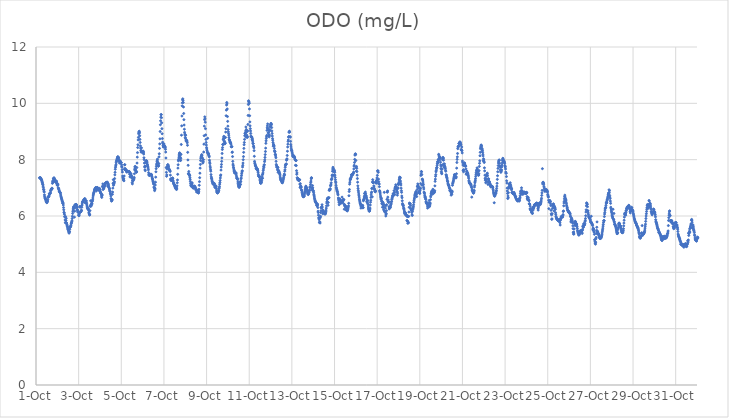
| Category | ODO (mg/L) |
|---|---|
| 44835.166666666664 | 7.36 |
| 44835.177083333336 | 7.35 |
| 44835.1875 | 7.35 |
| 44835.197916666664 | 7.35 |
| 44835.208333333336 | 7.36 |
| 44835.21875 | 7.35 |
| 44835.229166666664 | 7.32 |
| 44835.239583333336 | 7.31 |
| 44835.25 | 7.3 |
| 44835.260416666664 | 7.29 |
| 44835.270833333336 | 7.26 |
| 44835.28125 | 7.22 |
| 44835.291666666664 | 7.2 |
| 44835.302083333336 | 7.17 |
| 44835.3125 | 7.13 |
| 44835.322916666664 | 7.11 |
| 44835.333333333336 | 7.06 |
| 44835.34375 | 7.01 |
| 44835.354166666664 | 6.94 |
| 44835.364583333336 | 6.94 |
| 44835.375 | 6.88 |
| 44835.385416666664 | 6.85 |
| 44835.395833333336 | 6.75 |
| 44835.40625 | 6.69 |
| 44835.416666666664 | 6.64 |
| 44835.427083333336 | 6.64 |
| 44835.4375 | 6.61 |
| 44835.447916666664 | 6.61 |
| 44835.458333333336 | 6.57 |
| 44835.46875 | 6.54 |
| 44835.479166666664 | 6.52 |
| 44835.489583333336 | 6.49 |
| 44835.5 | 6.51 |
| 44835.510416666664 | 6.47 |
| 44835.520833333336 | 6.49 |
| 44835.53125 | 6.52 |
| 44835.541666666664 | 6.53 |
| 44835.552083333336 | 6.58 |
| 44835.5625 | 6.67 |
| 44835.572916666664 | 6.67 |
| 44835.583333333336 | 6.67 |
| 44835.59375 | 6.69 |
| 44835.604166666664 | 6.7 |
| 44835.614583333336 | 6.73 |
| 44835.625 | 6.79 |
| 44835.635416666664 | 6.79 |
| 44835.645833333336 | 6.8 |
| 44835.65625 | 6.8 |
| 44835.666666666664 | 6.8 |
| 44835.677083333336 | 6.84 |
| 44835.6875 | 6.9 |
| 44835.697916666664 | 6.91 |
| 44835.708333333336 | 6.95 |
| 44835.71875 | 6.95 |
| 44835.729166666664 | 6.95 |
| 44835.739583333336 | 6.96 |
| 44835.75 | 6.99 |
| 44835.760416666664 | 6.97 |
| 44835.770833333336 | 7.16 |
| 44835.78125 | 7.24 |
| 44835.791666666664 | 7.2 |
| 44835.802083333336 | 7.22 |
| 44835.8125 | 7.32 |
| 44835.822916666664 | 7.33 |
| 44835.833333333336 | 7.33 |
| 44835.84375 | 7.36 |
| 44835.854166666664 | 7.33 |
| 44835.864583333336 | 7.3 |
| 44835.875 | 7.3 |
| 44835.885416666664 | 7.27 |
| 44835.895833333336 | 7.25 |
| 44835.90625 | 7.25 |
| 44835.916666666664 | 7.2 |
| 44835.927083333336 | 7.21 |
| 44835.9375 | 7.24 |
| 44835.947916666664 | 7.2 |
| 44835.958333333336 | 7.24 |
| 44835.96875 | 7.2 |
| 44835.979166666664 | 7.14 |
| 44835.989583333336 | 7.1 |
| 44836.0 | 7.1 |
| 44836.010416666664 | 7.11 |
| 44836.020833333336 | 7.09 |
| 44836.03125 | 7.13 |
| 44836.041666666664 | 7 |
| 44836.052083333336 | 6.97 |
| 44836.0625 | 6.98 |
| 44836.072916666664 | 6.94 |
| 44836.083333333336 | 6.89 |
| 44836.09375 | 6.88 |
| 44836.104166666664 | 6.87 |
| 44836.114583333336 | 6.85 |
| 44836.125 | 6.84 |
| 44836.135416666664 | 6.83 |
| 44836.145833333336 | 6.81 |
| 44836.15625 | 6.75 |
| 44836.166666666664 | 6.71 |
| 44836.177083333336 | 6.68 |
| 44836.1875 | 6.65 |
| 44836.197916666664 | 6.62 |
| 44836.208333333336 | 6.59 |
| 44836.21875 | 6.56 |
| 44836.229166666664 | 6.53 |
| 44836.239583333336 | 6.51 |
| 44836.25 | 6.45 |
| 44836.260416666664 | 6.48 |
| 44836.270833333336 | 6.45 |
| 44836.28125 | 6.39 |
| 44836.291666666664 | 6.3 |
| 44836.302083333336 | 6.22 |
| 44836.3125 | 6.13 |
| 44836.322916666664 | 6.11 |
| 44836.333333333336 | 6.06 |
| 44836.34375 | 5.98 |
| 44836.354166666664 | 5.97 |
| 44836.364583333336 | 5.86 |
| 44836.375 | 5.76 |
| 44836.385416666664 | 5.98 |
| 44836.395833333336 | 5.78 |
| 44836.40625 | 5.84 |
| 44836.416666666664 | 5.92 |
| 44836.427083333336 | 5.75 |
| 44836.4375 | 5.75 |
| 44836.447916666664 | 5.7 |
| 44836.458333333336 | 5.67 |
| 44836.46875 | 5.63 |
| 44836.479166666664 | 5.61 |
| 44836.489583333336 | 5.56 |
| 44836.5 | 5.52 |
| 44836.510416666664 | 5.51 |
| 44836.520833333336 | 5.49 |
| 44836.53125 | 5.45 |
| 44836.541666666664 | 5.42 |
| 44836.552083333336 | 5.39 |
| 44836.5625 | 5.43 |
| 44836.572916666664 | 5.45 |
| 44836.583333333336 | 5.53 |
| 44836.59375 | 5.6 |
| 44836.604166666664 | 5.6 |
| 44836.614583333336 | 5.63 |
| 44836.625 | 5.63 |
| 44836.635416666664 | 5.67 |
| 44836.645833333336 | 5.72 |
| 44836.65625 | 5.75 |
| 44836.666666666664 | 5.76 |
| 44836.677083333336 | 5.8 |
| 44836.6875 | 5.83 |
| 44836.697916666664 | 5.91 |
| 44836.708333333336 | 5.99 |
| 44836.71875 | 6.09 |
| 44836.729166666664 | 6.16 |
| 44836.739583333336 | 6.21 |
| 44836.75 | 6.26 |
| 44836.760416666664 | 6.32 |
| 44836.770833333336 | 6.3 |
| 44836.78125 | 6.34 |
| 44836.791666666664 | 6.3 |
| 44836.802083333336 | 5.96 |
| 44836.8125 | 6.17 |
| 44836.822916666664 | 6.28 |
| 44836.833333333336 | 6.4 |
| 44836.84375 | 6.4 |
| 44836.854166666664 | 6.37 |
| 44836.864583333336 | 6.39 |
| 44836.875 | 6.41 |
| 44836.885416666664 | 6.41 |
| 44836.895833333336 | 6.4 |
| 44836.90625 | 6.36 |
| 44836.916666666664 | 6.31 |
| 44836.927083333336 | 6.3 |
| 44836.9375 | 6.22 |
| 44836.947916666664 | 6.21 |
| 44836.958333333336 | 6.14 |
| 44836.96875 | 6.15 |
| 44836.979166666664 | 6.16 |
| 44836.989583333336 | 6.13 |
| 44837.0 | 6.02 |
| 44837.010416666664 | 6.05 |
| 44837.020833333336 | 6.01 |
| 44837.03125 | 6.08 |
| 44837.041666666664 | 6.12 |
| 44837.052083333336 | 6.33 |
| 44837.0625 | 6.34 |
| 44837.072916666664 | 6.31 |
| 44837.083333333336 | 6.15 |
| 44837.09375 | 6.15 |
| 44837.104166666664 | 6.15 |
| 44837.114583333336 | 6.17 |
| 44837.125 | 6.2 |
| 44837.135416666664 | 6.2 |
| 44837.145833333336 | 6.31 |
| 44837.15625 | 6.38 |
| 44837.166666666664 | 6.43 |
| 44837.177083333336 | 6.49 |
| 44837.1875 | 6.5 |
| 44837.197916666664 | 6.51 |
| 44837.208333333336 | 6.53 |
| 44837.21875 | 6.54 |
| 44837.229166666664 | 6.55 |
| 44837.239583333336 | 6.57 |
| 44837.25 | 6.57 |
| 44837.260416666664 | 6.59 |
| 44837.270833333336 | 6.61 |
| 44837.28125 | 6.6 |
| 44837.291666666664 | 6.6 |
| 44837.302083333336 | 6.61 |
| 44837.3125 | 6.47 |
| 44837.322916666664 | 6.47 |
| 44837.333333333336 | 6.53 |
| 44837.34375 | 6.54 |
| 44837.354166666664 | 6.54 |
| 44837.364583333336 | 6.49 |
| 44837.375 | 6.44 |
| 44837.385416666664 | 6.39 |
| 44837.395833333336 | 6.35 |
| 44837.40625 | 6.31 |
| 44837.416666666664 | 6.26 |
| 44837.427083333336 | 6.27 |
| 44837.4375 | 6.26 |
| 44837.447916666664 | 6.25 |
| 44837.458333333336 | 6.24 |
| 44837.46875 | 6.2 |
| 44837.479166666664 | 6.13 |
| 44837.489583333336 | 6.08 |
| 44837.5 | 6.07 |
| 44837.510416666664 | 6.04 |
| 44837.520833333336 | 6.04 |
| 44837.53125 | 6.19 |
| 44837.541666666664 | 6.34 |
| 44837.552083333336 | 6.36 |
| 44837.5625 | 6.54 |
| 44837.572916666664 | 6.4 |
| 44837.583333333336 | 6.35 |
| 44837.59375 | 6.41 |
| 44837.604166666664 | 6.45 |
| 44837.614583333336 | 6.4 |
| 44837.625 | 6.45 |
| 44837.635416666664 | 6.52 |
| 44837.645833333336 | 6.54 |
| 44837.65625 | 6.58 |
| 44837.666666666664 | 6.64 |
| 44837.677083333336 | 6.71 |
| 44837.6875 | 6.75 |
| 44837.697916666664 | 6.79 |
| 44837.708333333336 | 6.82 |
| 44837.71875 | 6.84 |
| 44837.729166666664 | 6.88 |
| 44837.739583333336 | 6.92 |
| 44837.75 | 6.94 |
| 44837.760416666664 | 6.95 |
| 44837.770833333336 | 6.97 |
| 44837.78125 | 6.98 |
| 44837.791666666664 | 7 |
| 44837.802083333336 | 7.01 |
| 44837.8125 | 7 |
| 44837.822916666664 | 6.96 |
| 44837.833333333336 | 6.89 |
| 44837.84375 | 6.97 |
| 44837.854166666664 | 6.99 |
| 44837.864583333336 | 7.01 |
| 44837.875 | 7.01 |
| 44837.885416666664 | 7 |
| 44837.895833333336 | 7 |
| 44837.90625 | 6.96 |
| 44837.916666666664 | 6.96 |
| 44837.927083333336 | 6.92 |
| 44837.9375 | 6.94 |
| 44837.947916666664 | 6.94 |
| 44837.958333333336 | 6.92 |
| 44837.96875 | 6.96 |
| 44837.979166666664 | 6.98 |
| 44837.989583333336 | 6.9 |
| 44838.0 | 6.94 |
| 44838.010416666664 | 6.88 |
| 44838.020833333336 | 6.85 |
| 44838.03125 | 6.82 |
| 44838.041666666664 | 6.81 |
| 44838.052083333336 | 6.8 |
| 44838.0625 | 6.78 |
| 44838.072916666664 | 6.71 |
| 44838.083333333336 | 6.66 |
| 44838.09375 | 6.72 |
| 44838.104166666664 | 6.75 |
| 44838.114583333336 | 7.04 |
| 44838.125 | 7.06 |
| 44838.135416666664 | 7.14 |
| 44838.145833333336 | 6.94 |
| 44838.15625 | 6.99 |
| 44838.166666666664 | 6.98 |
| 44838.177083333336 | 6.97 |
| 44838.1875 | 7.01 |
| 44838.197916666664 | 7.04 |
| 44838.208333333336 | 7.05 |
| 44838.21875 | 7.09 |
| 44838.229166666664 | 7.09 |
| 44838.239583333336 | 7.13 |
| 44838.25 | 7.16 |
| 44838.260416666664 | 7.17 |
| 44838.270833333336 | 7.18 |
| 44838.28125 | 7.17 |
| 44838.291666666664 | 7.17 |
| 44838.302083333336 | 7.18 |
| 44838.3125 | 7.19 |
| 44838.322916666664 | 7.2 |
| 44838.333333333336 | 7.19 |
| 44838.34375 | 7.2 |
| 44838.354166666664 | 7.19 |
| 44838.364583333336 | 7.06 |
| 44838.375 | 7.07 |
| 44838.385416666664 | 7.15 |
| 44838.395833333336 | 7.11 |
| 44838.40625 | 7.06 |
| 44838.416666666664 | 7.02 |
| 44838.427083333336 | 7 |
| 44838.4375 | 6.96 |
| 44838.447916666664 | 6.97 |
| 44838.458333333336 | 6.9 |
| 44838.46875 | 6.88 |
| 44838.479166666664 | 6.86 |
| 44838.489583333336 | 6.8 |
| 44838.5 | 6.77 |
| 44838.510416666664 | 6.71 |
| 44838.520833333336 | 6.62 |
| 44838.53125 | 6.6 |
| 44838.541666666664 | 6.53 |
| 44838.552083333336 | 6.54 |
| 44838.5625 | 6.56 |
| 44838.572916666664 | 6.58 |
| 44838.583333333336 | 6.77 |
| 44838.59375 | 6.85 |
| 44838.604166666664 | 6.99 |
| 44838.614583333336 | 7.16 |
| 44838.625 | 7.29 |
| 44838.635416666664 | 7.09 |
| 44838.645833333336 | 7.13 |
| 44838.65625 | 7.16 |
| 44838.666666666664 | 7.18 |
| 44838.677083333336 | 7.22 |
| 44838.6875 | 7.33 |
| 44838.697916666664 | 7.46 |
| 44838.708333333336 | 7.55 |
| 44838.71875 | 7.66 |
| 44838.729166666664 | 7.73 |
| 44838.739583333336 | 7.78 |
| 44838.75 | 7.82 |
| 44838.760416666664 | 7.89 |
| 44838.770833333336 | 7.94 |
| 44838.78125 | 7.96 |
| 44838.791666666664 | 7.99 |
| 44838.802083333336 | 8.02 |
| 44838.8125 | 8.04 |
| 44838.822916666664 | 8.08 |
| 44838.833333333336 | 8.1 |
| 44838.84375 | 8.1 |
| 44838.854166666664 | 8.09 |
| 44838.864583333336 | 8.07 |
| 44838.875 | 8.05 |
| 44838.885416666664 | 7.99 |
| 44838.895833333336 | 7.98 |
| 44838.90625 | 7.96 |
| 44838.916666666664 | 7.88 |
| 44838.927083333336 | 7.92 |
| 44838.9375 | 7.96 |
| 44838.947916666664 | 7.94 |
| 44838.958333333336 | 7.93 |
| 44838.96875 | 7.9 |
| 44838.979166666664 | 7.91 |
| 44838.989583333336 | 7.9 |
| 44839.0 | 7.89 |
| 44839.010416666664 | 7.82 |
| 44839.020833333336 | 7.76 |
| 44839.03125 | 7.73 |
| 44839.041666666664 | 7.64 |
| 44839.052083333336 | 7.56 |
| 44839.0625 | 7.42 |
| 44839.072916666664 | 7.37 |
| 44839.083333333336 | 7.32 |
| 44839.09375 | 7.28 |
| 44839.104166666664 | 7.32 |
| 44839.114583333336 | 7.32 |
| 44839.125 | 7.25 |
| 44839.135416666664 | 7.42 |
| 44839.145833333336 | 7.66 |
| 44839.15625 | 7.82 |
| 44839.166666666664 | 7.82 |
| 44839.177083333336 | 7.69 |
| 44839.1875 | 7.64 |
| 44839.197916666664 | 7.64 |
| 44839.208333333336 | 7.62 |
| 44839.21875 | 7.64 |
| 44839.229166666664 | 7.64 |
| 44839.239583333336 | 7.61 |
| 44839.25 | 7.57 |
| 44839.260416666664 | 7.56 |
| 44839.270833333336 | 7.57 |
| 44839.28125 | 7.58 |
| 44839.291666666664 | 7.58 |
| 44839.302083333336 | 7.58 |
| 44839.3125 | 7.58 |
| 44839.322916666664 | 7.57 |
| 44839.333333333336 | 7.57 |
| 44839.34375 | 7.57 |
| 44839.354166666664 | 7.58 |
| 44839.364583333336 | 7.58 |
| 44839.375 | 7.58 |
| 44839.385416666664 | 7.56 |
| 44839.395833333336 | 7.48 |
| 44839.40625 | 7.39 |
| 44839.416666666664 | 7.48 |
| 44839.427083333336 | 7.52 |
| 44839.4375 | 7.5 |
| 44839.447916666664 | 7.49 |
| 44839.458333333336 | 7.49 |
| 44839.46875 | 7.43 |
| 44839.479166666664 | 7.38 |
| 44839.489583333336 | 7.41 |
| 44839.5 | 7.34 |
| 44839.510416666664 | 7.19 |
| 44839.520833333336 | 7.14 |
| 44839.53125 | 7.26 |
| 44839.541666666664 | 7.26 |
| 44839.552083333336 | 7.25 |
| 44839.5625 | 7.28 |
| 44839.572916666664 | 7.3 |
| 44839.583333333336 | 7.3 |
| 44839.59375 | 7.33 |
| 44839.604166666664 | 7.37 |
| 44839.614583333336 | 7.5 |
| 44839.625 | 7.64 |
| 44839.635416666664 | 7.7 |
| 44839.645833333336 | 7.75 |
| 44839.65625 | 7.76 |
| 44839.666666666664 | 7.65 |
| 44839.677083333336 | 7.62 |
| 44839.6875 | 7.59 |
| 44839.697916666664 | 7.58 |
| 44839.708333333336 | 7.55 |
| 44839.71875 | 7.57 |
| 44839.729166666664 | 7.72 |
| 44839.739583333336 | 7.88 |
| 44839.75 | 8.09 |
| 44839.760416666664 | 8.25 |
| 44839.770833333336 | 8.43 |
| 44839.78125 | 8.53 |
| 44839.791666666664 | 8.7 |
| 44839.802083333336 | 8.79 |
| 44839.8125 | 8.92 |
| 44839.822916666664 | 8.97 |
| 44839.833333333336 | 8.99 |
| 44839.84375 | 9.01 |
| 44839.854166666664 | 8.95 |
| 44839.864583333336 | 8.85 |
| 44839.875 | 8.72 |
| 44839.885416666664 | 8.61 |
| 44839.895833333336 | 8.49 |
| 44839.90625 | 8.41 |
| 44839.916666666664 | 8.33 |
| 44839.927083333336 | 8.27 |
| 44839.9375 | 8.31 |
| 44839.947916666664 | 8.42 |
| 44839.958333333336 | 8.27 |
| 44839.96875 | 8.29 |
| 44839.979166666664 | 8.3 |
| 44839.989583333336 | 8.27 |
| 44840.0 | 8.26 |
| 44840.010416666664 | 8.27 |
| 44840.020833333336 | 8.29 |
| 44840.03125 | 8.3 |
| 44840.041666666664 | 8.26 |
| 44840.052083333336 | 8.2 |
| 44840.0625 | 8.07 |
| 44840.072916666664 | 8 |
| 44840.083333333336 | 7.88 |
| 44840.09375 | 7.74 |
| 44840.104166666664 | 7.77 |
| 44840.114583333336 | 7.64 |
| 44840.125 | 7.61 |
| 44840.135416666664 | 7.76 |
| 44840.145833333336 | 7.9 |
| 44840.15625 | 7.93 |
| 44840.166666666664 | 7.95 |
| 44840.177083333336 | 7.96 |
| 44840.1875 | 7.96 |
| 44840.197916666664 | 7.93 |
| 44840.208333333336 | 7.89 |
| 44840.21875 | 7.84 |
| 44840.229166666664 | 7.81 |
| 44840.239583333336 | 7.77 |
| 44840.25 | 7.74 |
| 44840.260416666664 | 7.7 |
| 44840.270833333336 | 7.64 |
| 44840.28125 | 7.54 |
| 44840.291666666664 | 7.48 |
| 44840.302083333336 | 7.45 |
| 44840.3125 | 7.44 |
| 44840.322916666664 | 7.45 |
| 44840.333333333336 | 7.46 |
| 44840.34375 | 7.47 |
| 44840.354166666664 | 7.46 |
| 44840.364583333336 | 7.47 |
| 44840.375 | 7.47 |
| 44840.385416666664 | 7.48 |
| 44840.395833333336 | 7.48 |
| 44840.40625 | 7.48 |
| 44840.416666666664 | 7.46 |
| 44840.427083333336 | 7.42 |
| 44840.4375 | 7.39 |
| 44840.447916666664 | 7.35 |
| 44840.458333333336 | 7.32 |
| 44840.46875 | 7.31 |
| 44840.479166666664 | 7.25 |
| 44840.489583333336 | 7.21 |
| 44840.5 | 7.21 |
| 44840.510416666664 | 7.15 |
| 44840.520833333336 | 7.13 |
| 44840.53125 | 7.03 |
| 44840.541666666664 | 7.01 |
| 44840.552083333336 | 6.99 |
| 44840.5625 | 6.9 |
| 44840.572916666664 | 6.94 |
| 44840.583333333336 | 6.98 |
| 44840.59375 | 7.1 |
| 44840.604166666664 | 7.2 |
| 44840.614583333336 | 7.38 |
| 44840.625 | 7.57 |
| 44840.635416666664 | 7.68 |
| 44840.645833333336 | 7.76 |
| 44840.65625 | 7.82 |
| 44840.666666666664 | 7.87 |
| 44840.677083333336 | 7.94 |
| 44840.6875 | 7.98 |
| 44840.697916666664 | 8.02 |
| 44840.708333333336 | 7.91 |
| 44840.71875 | 7.87 |
| 44840.729166666664 | 7.77 |
| 44840.739583333336 | 7.77 |
| 44840.75 | 7.79 |
| 44840.760416666664 | 7.86 |
| 44840.770833333336 | 8.1 |
| 44840.78125 | 8.21 |
| 44840.791666666664 | 8.4 |
| 44840.802083333336 | 8.56 |
| 44840.8125 | 8.74 |
| 44840.822916666664 | 9 |
| 44840.833333333336 | 9.24 |
| 44840.84375 | 9.38 |
| 44840.854166666664 | 9.51 |
| 44840.864583333336 | 9.6 |
| 44840.875 | 9.6 |
| 44840.885416666664 | 9.49 |
| 44840.895833333336 | 9.31 |
| 44840.90625 | 9.1 |
| 44840.916666666664 | 8.92 |
| 44840.927083333336 | 8.75 |
| 44840.9375 | 8.62 |
| 44840.947916666664 | 8.57 |
| 44840.958333333336 | 8.5 |
| 44840.96875 | 8.45 |
| 44840.979166666664 | 8.48 |
| 44840.989583333336 | 8.54 |
| 44841.0 | 8.56 |
| 44841.010416666664 | 8.45 |
| 44841.020833333336 | 8.47 |
| 44841.03125 | 8.47 |
| 44841.041666666664 | 8.48 |
| 44841.052083333336 | 8.46 |
| 44841.0625 | 8.43 |
| 44841.072916666664 | 8.37 |
| 44841.083333333336 | 8.27 |
| 44841.09375 | 8.06 |
| 44841.104166666664 | 7.72 |
| 44841.114583333336 | 7.55 |
| 44841.125 | 7.41 |
| 44841.135416666664 | 7.46 |
| 44841.145833333336 | 7.67 |
| 44841.15625 | 7.73 |
| 44841.166666666664 | 7.77 |
| 44841.177083333336 | 7.82 |
| 44841.1875 | 7.82 |
| 44841.197916666664 | 7.79 |
| 44841.208333333336 | 7.77 |
| 44841.21875 | 7.74 |
| 44841.229166666664 | 7.68 |
| 44841.239583333336 | 7.66 |
| 44841.25 | 7.63 |
| 44841.260416666664 | 7.62 |
| 44841.270833333336 | 7.63 |
| 44841.28125 | 7.61 |
| 44841.291666666664 | 7.58 |
| 44841.302083333336 | 7.45 |
| 44841.3125 | 7.32 |
| 44841.322916666664 | 7.29 |
| 44841.333333333336 | 7.27 |
| 44841.34375 | 7.26 |
| 44841.354166666664 | 7.27 |
| 44841.364583333336 | 7.28 |
| 44841.375 | 7.31 |
| 44841.385416666664 | 7.33 |
| 44841.395833333336 | 7.34 |
| 44841.40625 | 7.35 |
| 44841.416666666664 | 7.33 |
| 44841.427083333336 | 7.26 |
| 44841.4375 | 7.21 |
| 44841.447916666664 | 7.17 |
| 44841.458333333336 | 7.16 |
| 44841.46875 | 7.13 |
| 44841.479166666664 | 7.11 |
| 44841.489583333336 | 7.11 |
| 44841.5 | 7.1 |
| 44841.510416666664 | 7.06 |
| 44841.520833333336 | 7.04 |
| 44841.53125 | 7.02 |
| 44841.541666666664 | 7 |
| 44841.552083333336 | 6.97 |
| 44841.5625 | 6.99 |
| 44841.572916666664 | 6.99 |
| 44841.583333333336 | 6.97 |
| 44841.59375 | 6.94 |
| 44841.604166666664 | 6.99 |
| 44841.614583333336 | 7.07 |
| 44841.625 | 7.18 |
| 44841.635416666664 | 7.28 |
| 44841.645833333336 | 7.48 |
| 44841.65625 | 7.7 |
| 44841.666666666664 | 7.82 |
| 44841.677083333336 | 7.96 |
| 44841.6875 | 8 |
| 44841.697916666664 | 8.06 |
| 44841.708333333336 | 8.13 |
| 44841.71875 | 8.19 |
| 44841.729166666664 | 8.23 |
| 44841.739583333336 | 8.24 |
| 44841.75 | 8.15 |
| 44841.760416666664 | 8.09 |
| 44841.770833333336 | 7.98 |
| 44841.78125 | 7.97 |
| 44841.791666666664 | 8.05 |
| 44841.802083333336 | 8.19 |
| 44841.8125 | 8.54 |
| 44841.822916666664 | 8.87 |
| 44841.833333333336 | 9.2 |
| 44841.84375 | 9.55 |
| 44841.854166666664 | 9.91 |
| 44841.864583333336 | 10.02 |
| 44841.875 | 10.13 |
| 44841.885416666664 | 10.16 |
| 44841.895833333336 | 10.1 |
| 44841.90625 | 10.03 |
| 44841.916666666664 | 9.87 |
| 44841.927083333336 | 9.64 |
| 44841.9375 | 9.42 |
| 44841.947916666664 | 9.23 |
| 44841.958333333336 | 9.08 |
| 44841.96875 | 8.97 |
| 44841.979166666664 | 8.91 |
| 44841.989583333336 | 8.87 |
| 44842.0 | 8.79 |
| 44842.010416666664 | 8.76 |
| 44842.020833333336 | 8.87 |
| 44842.03125 | 8.7 |
| 44842.041666666664 | 8.66 |
| 44842.052083333336 | 8.68 |
| 44842.0625 | 8.69 |
| 44842.072916666664 | 8.66 |
| 44842.083333333336 | 8.66 |
| 44842.09375 | 8.6 |
| 44842.104166666664 | 8.51 |
| 44842.114583333336 | 8.26 |
| 44842.125 | 7.99 |
| 44842.135416666664 | 7.8 |
| 44842.145833333336 | 7.5 |
| 44842.15625 | 7.51 |
| 44842.166666666664 | 7.58 |
| 44842.177083333336 | 7.47 |
| 44842.1875 | 7.48 |
| 44842.197916666664 | 7.43 |
| 44842.208333333336 | 7.44 |
| 44842.21875 | 7.36 |
| 44842.229166666664 | 7.3 |
| 44842.239583333336 | 7.23 |
| 44842.25 | 7.16 |
| 44842.260416666664 | 7.1 |
| 44842.270833333336 | 7.07 |
| 44842.28125 | 7.08 |
| 44842.291666666664 | 7.05 |
| 44842.302083333336 | 7.1 |
| 44842.3125 | 7.15 |
| 44842.322916666664 | 7.18 |
| 44842.333333333336 | 7.09 |
| 44842.34375 | 7.04 |
| 44842.354166666664 | 7.03 |
| 44842.364583333336 | 7 |
| 44842.375 | 6.99 |
| 44842.385416666664 | 7.02 |
| 44842.395833333336 | 7 |
| 44842.40625 | 7.04 |
| 44842.416666666664 | 7.05 |
| 44842.427083333336 | 7.06 |
| 44842.4375 | 7.05 |
| 44842.447916666664 | 7.05 |
| 44842.458333333336 | 7.03 |
| 44842.46875 | 7.01 |
| 44842.479166666664 | 6.99 |
| 44842.489583333336 | 6.95 |
| 44842.5 | 6.93 |
| 44842.510416666664 | 6.92 |
| 44842.520833333336 | 6.91 |
| 44842.53125 | 6.85 |
| 44842.541666666664 | 6.92 |
| 44842.552083333336 | 6.92 |
| 44842.5625 | 6.9 |
| 44842.572916666664 | 6.88 |
| 44842.583333333336 | 6.87 |
| 44842.59375 | 6.84 |
| 44842.604166666664 | 6.84 |
| 44842.614583333336 | 6.82 |
| 44842.625 | 6.82 |
| 44842.635416666664 | 6.88 |
| 44842.645833333336 | 6.95 |
| 44842.65625 | 7.09 |
| 44842.666666666664 | 7.22 |
| 44842.677083333336 | 7.36 |
| 44842.6875 | 7.52 |
| 44842.697916666664 | 7.7 |
| 44842.708333333336 | 7.83 |
| 44842.71875 | 7.97 |
| 44842.729166666664 | 8.05 |
| 44842.739583333336 | 8.09 |
| 44842.75 | 8.12 |
| 44842.760416666664 | 8.14 |
| 44842.770833333336 | 8.18 |
| 44842.78125 | 8.15 |
| 44842.791666666664 | 8.08 |
| 44842.802083333336 | 8.05 |
| 44842.8125 | 7.95 |
| 44842.822916666664 | 7.88 |
| 44842.833333333336 | 7.92 |
| 44842.84375 | 7.92 |
| 44842.854166666664 | 8 |
| 44842.864583333336 | 8.27 |
| 44842.875 | 8.55 |
| 44842.885416666664 | 8.85 |
| 44842.895833333336 | 9.19 |
| 44842.90625 | 9.42 |
| 44842.916666666664 | 9.52 |
| 44842.927083333336 | 9.45 |
| 44842.9375 | 9.33 |
| 44842.947916666664 | 9.1 |
| 44842.958333333336 | 8.88 |
| 44842.96875 | 8.72 |
| 44842.979166666664 | 8.61 |
| 44842.989583333336 | 8.52 |
| 44843.0 | 8.43 |
| 44843.010416666664 | 8.38 |
| 44843.020833333336 | 8.33 |
| 44843.03125 | 8.27 |
| 44843.041666666664 | 8.25 |
| 44843.052083333336 | 8.76 |
| 44843.0625 | 8.25 |
| 44843.072916666664 | 8.21 |
| 44843.083333333336 | 8.2 |
| 44843.09375 | 8.21 |
| 44843.104166666664 | 8.15 |
| 44843.114583333336 | 8.13 |
| 44843.125 | 8.1 |
| 44843.135416666664 | 7.98 |
| 44843.145833333336 | 7.91 |
| 44843.15625 | 7.86 |
| 44843.166666666664 | 7.77 |
| 44843.177083333336 | 7.71 |
| 44843.1875 | 7.64 |
| 44843.197916666664 | 7.59 |
| 44843.208333333336 | 7.47 |
| 44843.21875 | 7.39 |
| 44843.229166666664 | 7.33 |
| 44843.239583333336 | 7.34 |
| 44843.25 | 7.28 |
| 44843.260416666664 | 7.24 |
| 44843.270833333336 | 7.22 |
| 44843.28125 | 7.19 |
| 44843.291666666664 | 7.16 |
| 44843.302083333336 | 7.13 |
| 44843.3125 | 7.14 |
| 44843.322916666664 | 7.14 |
| 44843.333333333336 | 7.14 |
| 44843.34375 | 7.14 |
| 44843.354166666664 | 7.16 |
| 44843.364583333336 | 7.15 |
| 44843.375 | 7.1 |
| 44843.385416666664 | 7.05 |
| 44843.395833333336 | 7.02 |
| 44843.40625 | 7.01 |
| 44843.416666666664 | 7.02 |
| 44843.427083333336 | 7.06 |
| 44843.4375 | 7.07 |
| 44843.447916666664 | 7.04 |
| 44843.458333333336 | 6.98 |
| 44843.46875 | 6.92 |
| 44843.479166666664 | 6.87 |
| 44843.489583333336 | 6.84 |
| 44843.5 | 6.83 |
| 44843.510416666664 | 6.82 |
| 44843.520833333336 | 6.82 |
| 44843.53125 | 6.84 |
| 44843.541666666664 | 6.85 |
| 44843.552083333336 | 6.86 |
| 44843.5625 | 6.89 |
| 44843.572916666664 | 6.9 |
| 44843.583333333336 | 6.97 |
| 44843.59375 | 7 |
| 44843.604166666664 | 7.05 |
| 44843.614583333336 | 7.13 |
| 44843.625 | 7.19 |
| 44843.635416666664 | 7.26 |
| 44843.645833333336 | 7.35 |
| 44843.65625 | 7.43 |
| 44843.666666666664 | 7.46 |
| 44843.677083333336 | 7.63 |
| 44843.6875 | 7.74 |
| 44843.697916666664 | 7.83 |
| 44843.708333333336 | 7.94 |
| 44843.71875 | 8.06 |
| 44843.729166666664 | 8.22 |
| 44843.739583333336 | 8.36 |
| 44843.75 | 8.43 |
| 44843.760416666664 | 8.54 |
| 44843.770833333336 | 8.54 |
| 44843.78125 | 8.71 |
| 44843.791666666664 | 8.74 |
| 44843.802083333336 | 8.8 |
| 44843.8125 | 8.83 |
| 44843.822916666664 | 8.63 |
| 44843.833333333336 | 8.76 |
| 44843.84375 | 8.65 |
| 44843.854166666664 | 8.56 |
| 44843.864583333336 | 8.58 |
| 44843.875 | 8.59 |
| 44843.885416666664 | 8.79 |
| 44843.895833333336 | 8.98 |
| 44843.90625 | 9.1 |
| 44843.916666666664 | 9.56 |
| 44843.927083333336 | 9.76 |
| 44843.9375 | 9.94 |
| 44843.947916666664 | 10.03 |
| 44843.958333333336 | 9.98 |
| 44843.96875 | 9.8 |
| 44843.979166666664 | 9.53 |
| 44843.989583333336 | 9.36 |
| 44844.0 | 9.19 |
| 44844.010416666664 | 9.07 |
| 44844.020833333336 | 8.99 |
| 44844.03125 | 8.93 |
| 44844.041666666664 | 8.87 |
| 44844.052083333336 | 8.79 |
| 44844.0625 | 8.72 |
| 44844.072916666664 | 8.7 |
| 44844.083333333336 | 8.67 |
| 44844.09375 | 8.63 |
| 44844.104166666664 | 8.62 |
| 44844.114583333336 | 8.62 |
| 44844.125 | 8.59 |
| 44844.135416666664 | 8.59 |
| 44844.145833333336 | 8.55 |
| 44844.15625 | 8.46 |
| 44844.166666666664 | 8.47 |
| 44844.177083333336 | 8.46 |
| 44844.1875 | 8.46 |
| 44844.197916666664 | 8.26 |
| 44844.208333333336 | 8.27 |
| 44844.21875 | 8.11 |
| 44844.229166666664 | 7.94 |
| 44844.239583333336 | 7.84 |
| 44844.25 | 7.79 |
| 44844.260416666664 | 7.73 |
| 44844.270833333336 | 7.7 |
| 44844.28125 | 7.64 |
| 44844.291666666664 | 7.59 |
| 44844.302083333336 | 7.61 |
| 44844.3125 | 7.53 |
| 44844.322916666664 | 7.53 |
| 44844.333333333336 | 7.54 |
| 44844.34375 | 7.53 |
| 44844.354166666664 | 7.53 |
| 44844.364583333336 | 7.54 |
| 44844.375 | 7.53 |
| 44844.385416666664 | 7.51 |
| 44844.395833333336 | 7.45 |
| 44844.40625 | 7.39 |
| 44844.416666666664 | 7.34 |
| 44844.427083333336 | 7.35 |
| 44844.4375 | 7.32 |
| 44844.447916666664 | 7.33 |
| 44844.458333333336 | 7.29 |
| 44844.46875 | 7.21 |
| 44844.479166666664 | 7.16 |
| 44844.489583333336 | 7.11 |
| 44844.5 | 7.07 |
| 44844.510416666664 | 7.05 |
| 44844.520833333336 | 7.02 |
| 44844.53125 | 7.02 |
| 44844.541666666664 | 7.05 |
| 44844.552083333336 | 7.07 |
| 44844.5625 | 7.11 |
| 44844.572916666664 | 7.18 |
| 44844.583333333336 | 7.22 |
| 44844.59375 | 7.12 |
| 44844.604166666664 | 7.23 |
| 44844.614583333336 | 7.32 |
| 44844.625 | 7.35 |
| 44844.635416666664 | 7.43 |
| 44844.645833333336 | 7.5 |
| 44844.65625 | 7.56 |
| 44844.666666666664 | 7.6 |
| 44844.677083333336 | 7.6 |
| 44844.6875 | 7.74 |
| 44844.697916666664 | 7.8 |
| 44844.708333333336 | 7.88 |
| 44844.71875 | 8 |
| 44844.729166666664 | 8.11 |
| 44844.739583333336 | 8.26 |
| 44844.75 | 8.4 |
| 44844.760416666664 | 8.53 |
| 44844.770833333336 | 8.61 |
| 44844.78125 | 8.72 |
| 44844.791666666664 | 8.85 |
| 44844.802083333336 | 8.93 |
| 44844.8125 | 8.92 |
| 44844.822916666664 | 8.96 |
| 44844.833333333336 | 9.02 |
| 44844.84375 | 9.16 |
| 44844.854166666664 | 8.8 |
| 44844.864583333336 | 9.07 |
| 44844.875 | 8.98 |
| 44844.885416666664 | 8.87 |
| 44844.895833333336 | 8.83 |
| 44844.90625 | 8.79 |
| 44844.916666666664 | 8.81 |
| 44844.927083333336 | 9.02 |
| 44844.9375 | 9.25 |
| 44844.947916666664 | 9.57 |
| 44844.958333333336 | 9.96 |
| 44844.96875 | 10.09 |
| 44844.979166666664 | 10.06 |
| 44844.989583333336 | 10.04 |
| 44845.0 | 10 |
| 44845.010416666664 | 9.8 |
| 44845.020833333336 | 9.56 |
| 44845.03125 | 9.34 |
| 44845.041666666664 | 9.2 |
| 44845.052083333336 | 9.1 |
| 44845.0625 | 9.02 |
| 44845.072916666664 | 8.93 |
| 44845.083333333336 | 8.83 |
| 44845.09375 | 8.81 |
| 44845.104166666664 | 8.81 |
| 44845.114583333336 | 8.81 |
| 44845.125 | 8.79 |
| 44845.135416666664 | 8.71 |
| 44845.145833333336 | 8.75 |
| 44845.15625 | 8.69 |
| 44845.166666666664 | 8.63 |
| 44845.177083333336 | 8.57 |
| 44845.1875 | 8.57 |
| 44845.197916666664 | 8.47 |
| 44845.208333333336 | 8.48 |
| 44845.21875 | 8.42 |
| 44845.229166666664 | 8.32 |
| 44845.239583333336 | 8.12 |
| 44845.25 | 7.94 |
| 44845.260416666664 | 7.88 |
| 44845.270833333336 | 7.85 |
| 44845.28125 | 7.81 |
| 44845.291666666664 | 7.8 |
| 44845.302083333336 | 7.76 |
| 44845.3125 | 7.75 |
| 44845.322916666664 | 7.69 |
| 44845.333333333336 | 7.7 |
| 44845.34375 | 7.66 |
| 44845.354166666664 | 7.69 |
| 44845.364583333336 | 7.67 |
| 44845.375 | 7.68 |
| 44845.385416666664 | 7.65 |
| 44845.395833333336 | 7.63 |
| 44845.40625 | 7.6 |
| 44845.416666666664 | 7.55 |
| 44845.427083333336 | 7.48 |
| 44845.4375 | 7.43 |
| 44845.447916666664 | 7.41 |
| 44845.458333333336 | 7.41 |
| 44845.46875 | 7.4 |
| 44845.479166666664 | 7.41 |
| 44845.489583333336 | 7.37 |
| 44845.5 | 7.31 |
| 44845.510416666664 | 7.26 |
| 44845.520833333336 | 7.21 |
| 44845.53125 | 7.17 |
| 44845.541666666664 | 7.16 |
| 44845.552083333336 | 7.17 |
| 44845.5625 | 7.19 |
| 44845.572916666664 | 7.21 |
| 44845.583333333336 | 7.26 |
| 44845.59375 | 7.33 |
| 44845.604166666664 | 7.39 |
| 44845.614583333336 | 7.46 |
| 44845.625 | 7.34 |
| 44845.635416666664 | 7.49 |
| 44845.645833333336 | 7.53 |
| 44845.65625 | 7.61 |
| 44845.666666666664 | 7.67 |
| 44845.677083333336 | 7.76 |
| 44845.6875 | 7.73 |
| 44845.697916666664 | 7.81 |
| 44845.708333333336 | 7.82 |
| 44845.71875 | 7.93 |
| 44845.729166666664 | 7.99 |
| 44845.739583333336 | 8.08 |
| 44845.75 | 8.18 |
| 44845.760416666664 | 8.29 |
| 44845.770833333336 | 8.41 |
| 44845.78125 | 8.58 |
| 44845.791666666664 | 8.67 |
| 44845.802083333336 | 8.75 |
| 44845.8125 | 8.81 |
| 44845.822916666664 | 8.86 |
| 44845.833333333336 | 9.04 |
| 44845.84375 | 9.13 |
| 44845.854166666664 | 9.2 |
| 44845.864583333336 | 9.27 |
| 44845.875 | 9.11 |
| 44845.885416666664 | 8.95 |
| 44845.895833333336 | 9.05 |
| 44845.90625 | 8.96 |
| 44845.916666666664 | 8.88 |
| 44845.927083333336 | 8.84 |
| 44845.9375 | 8.81 |
| 44845.947916666664 | 8.87 |
| 44845.958333333336 | 9.02 |
| 44845.96875 | 9.07 |
| 44845.979166666664 | 9.17 |
| 44845.989583333336 | 9.18 |
| 44846.0 | 9.24 |
| 44846.010416666664 | 9.26 |
| 44846.020833333336 | 9.29 |
| 44846.03125 | 9.27 |
| 44846.041666666664 | 9.24 |
| 44846.052083333336 | 9.14 |
| 44846.0625 | 9.02 |
| 44846.072916666664 | 8.93 |
| 44846.083333333336 | 8.84 |
| 44846.09375 | 8.75 |
| 44846.104166666664 | 8.69 |
| 44846.114583333336 | 8.61 |
| 44846.125 | 8.48 |
| 44846.135416666664 | 8.55 |
| 44846.145833333336 | 8.52 |
| 44846.15625 | 8.51 |
| 44846.166666666664 | 8.48 |
| 44846.177083333336 | 8.4 |
| 44846.1875 | 8.32 |
| 44846.197916666664 | 8.28 |
| 44846.208333333336 | 8.29 |
| 44846.21875 | 8.18 |
| 44846.229166666664 | 8.19 |
| 44846.239583333336 | 8.13 |
| 44846.25 | 8.07 |
| 44846.260416666664 | 7.94 |
| 44846.270833333336 | 7.83 |
| 44846.28125 | 7.79 |
| 44846.291666666664 | 7.73 |
| 44846.302083333336 | 7.75 |
| 44846.3125 | 7.74 |
| 44846.322916666664 | 7.64 |
| 44846.333333333336 | 7.72 |
| 44846.34375 | 7.72 |
| 44846.354166666664 | 7.55 |
| 44846.364583333336 | 7.63 |
| 44846.375 | 7.6 |
| 44846.385416666664 | 7.58 |
| 44846.395833333336 | 7.59 |
| 44846.40625 | 7.55 |
| 44846.416666666664 | 7.52 |
| 44846.427083333336 | 7.5 |
| 44846.4375 | 7.47 |
| 44846.447916666664 | 7.42 |
| 44846.458333333336 | 7.36 |
| 44846.46875 | 7.32 |
| 44846.479166666664 | 7.29 |
| 44846.489583333336 | 7.27 |
| 44846.5 | 7.26 |
| 44846.510416666664 | 7.25 |
| 44846.520833333336 | 7.24 |
| 44846.53125 | 7.21 |
| 44846.541666666664 | 7.18 |
| 44846.552083333336 | 7.18 |
| 44846.5625 | 7.19 |
| 44846.572916666664 | 7.23 |
| 44846.583333333336 | 7.25 |
| 44846.59375 | 7.29 |
| 44846.604166666664 | 7.33 |
| 44846.614583333336 | 7.37 |
| 44846.625 | 7.42 |
| 44846.635416666664 | 7.45 |
| 44846.645833333336 | 7.49 |
| 44846.65625 | 7.46 |
| 44846.666666666664 | 7.59 |
| 44846.677083333336 | 7.64 |
| 44846.6875 | 7.73 |
| 44846.697916666664 | 7.79 |
| 44846.708333333336 | 7.83 |
| 44846.71875 | 7.83 |
| 44846.729166666664 | 7.84 |
| 44846.739583333336 | 7.85 |
| 44846.75 | 7.98 |
| 44846.760416666664 | 8.01 |
| 44846.770833333336 | 8.03 |
| 44846.78125 | 8.15 |
| 44846.791666666664 | 8.3 |
| 44846.802083333336 | 8.45 |
| 44846.8125 | 8.55 |
| 44846.822916666664 | 8.65 |
| 44846.833333333336 | 8.7 |
| 44846.84375 | 8.8 |
| 44846.854166666664 | 8.82 |
| 44846.864583333336 | 8.97 |
| 44846.875 | 8.99 |
| 44846.885416666664 | 9.01 |
| 44846.895833333336 | 8.98 |
| 44846.90625 | 8.81 |
| 44846.916666666664 | 8.81 |
| 44846.927083333336 | 8.8 |
| 44846.9375 | 8.65 |
| 44846.947916666664 | 8.54 |
| 44846.958333333336 | 8.48 |
| 44846.96875 | 8.41 |
| 44846.979166666664 | 8.35 |
| 44846.989583333336 | 8.32 |
| 44847.0 | 8.31 |
| 44847.010416666664 | 8.27 |
| 44847.020833333336 | 8.23 |
| 44847.03125 | 8.17 |
| 44847.041666666664 | 8.13 |
| 44847.052083333336 | 8.13 |
| 44847.0625 | 8.11 |
| 44847.072916666664 | 8.1 |
| 44847.083333333336 | 8.14 |
| 44847.09375 | 8.13 |
| 44847.104166666664 | 8.11 |
| 44847.114583333336 | 8.1 |
| 44847.125 | 8.08 |
| 44847.135416666664 | 8.06 |
| 44847.145833333336 | 8.01 |
| 44847.15625 | 7.99 |
| 44847.166666666664 | 7.8 |
| 44847.177083333336 | 7.98 |
| 44847.1875 | 7.97 |
| 44847.197916666664 | 7.97 |
| 44847.208333333336 | 7.79 |
| 44847.21875 | 7.61 |
| 44847.229166666664 | 7.48 |
| 44847.239583333336 | 7.53 |
| 44847.25 | 7.36 |
| 44847.260416666664 | 7.34 |
| 44847.270833333336 | 7.29 |
| 44847.28125 | 7.33 |
| 44847.291666666664 | 7.28 |
| 44847.302083333336 | 7.32 |
| 44847.3125 | 7.27 |
| 44847.322916666664 | 7.28 |
| 44847.333333333336 | 7.26 |
| 44847.34375 | 7.28 |
| 44847.354166666664 | 7.29 |
| 44847.364583333336 | 7.29 |
| 44847.375 | 7.13 |
| 44847.385416666664 | 7.01 |
| 44847.395833333336 | 7.15 |
| 44847.40625 | 7.06 |
| 44847.416666666664 | 7.04 |
| 44847.427083333336 | 7.05 |
| 44847.4375 | 7.01 |
| 44847.447916666664 | 6.93 |
| 44847.458333333336 | 6.91 |
| 44847.46875 | 6.89 |
| 44847.479166666664 | 6.84 |
| 44847.489583333336 | 6.79 |
| 44847.5 | 6.76 |
| 44847.510416666664 | 6.73 |
| 44847.520833333336 | 6.7 |
| 44847.53125 | 6.68 |
| 44847.541666666664 | 6.7 |
| 44847.552083333336 | 6.69 |
| 44847.5625 | 6.7 |
| 44847.572916666664 | 6.7 |
| 44847.583333333336 | 6.74 |
| 44847.59375 | 6.79 |
| 44847.604166666664 | 6.84 |
| 44847.614583333336 | 6.87 |
| 44847.625 | 6.93 |
| 44847.635416666664 | 6.98 |
| 44847.645833333336 | 7.02 |
| 44847.65625 | 7.06 |
| 44847.666666666664 | 7.04 |
| 44847.677083333336 | 7.01 |
| 44847.6875 | 6.91 |
| 44847.697916666664 | 6.99 |
| 44847.708333333336 | 6.95 |
| 44847.71875 | 6.91 |
| 44847.729166666664 | 6.85 |
| 44847.739583333336 | 6.81 |
| 44847.75 | 6.78 |
| 44847.760416666664 | 6.78 |
| 44847.770833333336 | 6.76 |
| 44847.78125 | 6.79 |
| 44847.791666666664 | 6.83 |
| 44847.802083333336 | 6.83 |
| 44847.8125 | 6.89 |
| 44847.822916666664 | 6.9 |
| 44847.833333333336 | 6.92 |
| 44847.84375 | 7.01 |
| 44847.854166666664 | 7.04 |
| 44847.864583333336 | 7.03 |
| 44847.875 | 7.12 |
| 44847.885416666664 | 7.19 |
| 44847.895833333336 | 7.24 |
| 44847.90625 | 7.32 |
| 44847.916666666664 | 7.36 |
| 44847.927083333336 | 7.35 |
| 44847.9375 | 7 |
| 44847.947916666664 | 6.93 |
| 44847.958333333336 | 6.99 |
| 44847.96875 | 7.08 |
| 44847.979166666664 | 7 |
| 44847.989583333336 | 6.91 |
| 44848.0 | 6.88 |
| 44848.010416666664 | 6.89 |
| 44848.020833333336 | 6.83 |
| 44848.03125 | 6.77 |
| 44848.041666666664 | 6.73 |
| 44848.052083333336 | 6.68 |
| 44848.0625 | 6.63 |
| 44848.072916666664 | 6.59 |
| 44848.083333333336 | 6.54 |
| 44848.09375 | 6.53 |
| 44848.104166666664 | 6.51 |
| 44848.114583333336 | 6.5 |
| 44848.125 | 6.48 |
| 44848.135416666664 | 6.48 |
| 44848.145833333336 | 6.44 |
| 44848.15625 | 6.44 |
| 44848.166666666664 | 6.38 |
| 44848.177083333336 | 6.37 |
| 44848.1875 | 6.36 |
| 44848.197916666664 | 6.39 |
| 44848.208333333336 | 6.42 |
| 44848.21875 | 6.3 |
| 44848.229166666664 | 6.17 |
| 44848.239583333336 | 6.12 |
| 44848.25 | 6.03 |
| 44848.260416666664 | 5.94 |
| 44848.270833333336 | 5.91 |
| 44848.28125 | 5.87 |
| 44848.291666666664 | 5.77 |
| 44848.302083333336 | 5.77 |
| 44848.3125 | 5.79 |
| 44848.322916666664 | 5.75 |
| 44848.333333333336 | 5.94 |
| 44848.34375 | 5.99 |
| 44848.354166666664 | 6.12 |
| 44848.364583333336 | 6.19 |
| 44848.375 | 6.29 |
| 44848.385416666664 | 6.31 |
| 44848.395833333336 | 6.32 |
| 44848.40625 | 6.29 |
| 44848.416666666664 | 6.4 |
| 44848.427083333336 | 6.32 |
| 44848.4375 | 6.18 |
| 44848.447916666664 | 6.08 |
| 44848.458333333336 | 6.21 |
| 44848.46875 | 6.19 |
| 44848.479166666664 | 6.16 |
| 44848.489583333336 | 6.13 |
| 44848.5 | 6.13 |
| 44848.510416666664 | 6.13 |
| 44848.520833333336 | 6.12 |
| 44848.53125 | 6.1 |
| 44848.541666666664 | 6.08 |
| 44848.552083333336 | 6.07 |
| 44848.5625 | 6.07 |
| 44848.572916666664 | 6.09 |
| 44848.583333333336 | 6.12 |
| 44848.59375 | 6.16 |
| 44848.604166666664 | 6.21 |
| 44848.614583333336 | 6.28 |
| 44848.625 | 6.36 |
| 44848.635416666664 | 6.46 |
| 44848.645833333336 | 6.51 |
| 44848.65625 | 6.58 |
| 44848.666666666664 | 6.61 |
| 44848.677083333336 | 6.63 |
| 44848.6875 | 6.64 |
| 44848.697916666664 | 6.38 |
| 44848.708333333336 | 6.48 |
| 44848.71875 | 6.63 |
| 44848.729166666664 | 6.65 |
| 44848.739583333336 | 6.65 |
| 44848.75 | 6.91 |
| 44848.760416666664 | 6.93 |
| 44848.770833333336 | 6.95 |
| 44848.78125 | 6.92 |
| 44848.791666666664 | 6.94 |
| 44848.802083333336 | 6.97 |
| 44848.8125 | 7.07 |
| 44848.822916666664 | 7.09 |
| 44848.833333333336 | 7.13 |
| 44848.84375 | 7.18 |
| 44848.854166666664 | 7.29 |
| 44848.864583333336 | 7.3 |
| 44848.875 | 7.34 |
| 44848.885416666664 | 7.43 |
| 44848.895833333336 | 7.46 |
| 44848.90625 | 7.59 |
| 44848.916666666664 | 7.67 |
| 44848.927083333336 | 7.73 |
| 44848.9375 | 7.64 |
| 44848.947916666664 | 7.68 |
| 44848.958333333336 | 7.59 |
| 44848.96875 | 7.44 |
| 44848.979166666664 | 7.46 |
| 44848.989583333336 | 7.58 |
| 44849.0 | 7.62 |
| 44849.010416666664 | 7.55 |
| 44849.020833333336 | 7.45 |
| 44849.03125 | 7.37 |
| 44849.041666666664 | 7.29 |
| 44849.052083333336 | 7.22 |
| 44849.0625 | 7.18 |
| 44849.072916666664 | 7.09 |
| 44849.083333333336 | 7.02 |
| 44849.09375 | 6.98 |
| 44849.104166666664 | 6.93 |
| 44849.114583333336 | 6.92 |
| 44849.125 | 6.88 |
| 44849.135416666664 | 6.87 |
| 44849.145833333336 | 6.82 |
| 44849.15625 | 6.78 |
| 44849.166666666664 | 6.75 |
| 44849.177083333336 | 6.64 |
| 44849.1875 | 6.6 |
| 44849.197916666664 | 6.54 |
| 44849.208333333336 | 6.48 |
| 44849.21875 | 6.4 |
| 44849.229166666664 | 6.59 |
| 44849.239583333336 | 6.61 |
| 44849.25 | 6.57 |
| 44849.260416666664 | 6.58 |
| 44849.270833333336 | 6.56 |
| 44849.28125 | 6.47 |
| 44849.291666666664 | 6.45 |
| 44849.302083333336 | 6.46 |
| 44849.3125 | 6.5 |
| 44849.322916666664 | 6.52 |
| 44849.333333333336 | 6.53 |
| 44849.34375 | 6.5 |
| 44849.354166666664 | 6.67 |
| 44849.364583333336 | 6.54 |
| 44849.375 | 6.48 |
| 44849.385416666664 | 6.51 |
| 44849.395833333336 | 6.54 |
| 44849.40625 | 6.59 |
| 44849.416666666664 | 6.58 |
| 44849.427083333336 | 6.58 |
| 44849.4375 | 6.58 |
| 44849.447916666664 | 6.42 |
| 44849.458333333336 | 6.24 |
| 44849.46875 | 6.4 |
| 44849.479166666664 | 6.36 |
| 44849.489583333336 | 6.35 |
| 44849.5 | 6.37 |
| 44849.510416666664 | 6.36 |
| 44849.520833333336 | 6.32 |
| 44849.53125 | 6.32 |
| 44849.541666666664 | 6.29 |
| 44849.552083333336 | 6.23 |
| 44849.5625 | 6.2 |
| 44849.572916666664 | 6.2 |
| 44849.583333333336 | 6.2 |
| 44849.59375 | 6.18 |
| 44849.604166666664 | 6.19 |
| 44849.614583333336 | 6.21 |
| 44849.625 | 6.24 |
| 44849.635416666664 | 6.28 |
| 44849.645833333336 | 6.32 |
| 44849.65625 | 6.36 |
| 44849.666666666664 | 6.45 |
| 44849.677083333336 | 6.72 |
| 44849.6875 | 6.87 |
| 44849.697916666664 | 6.94 |
| 44849.708333333336 | 7.13 |
| 44849.71875 | 7.2 |
| 44849.729166666664 | 7.28 |
| 44849.739583333336 | 7.32 |
| 44849.75 | 7.3 |
| 44849.760416666664 | 7.32 |
| 44849.770833333336 | 7.37 |
| 44849.78125 | 7.38 |
| 44849.791666666664 | 7.46 |
| 44849.802083333336 | 7.46 |
| 44849.8125 | 7.47 |
| 44849.822916666664 | 7.47 |
| 44849.833333333336 | 7.44 |
| 44849.84375 | 7.48 |
| 44849.854166666664 | 7.49 |
| 44849.864583333336 | 7.49 |
| 44849.875 | 7.51 |
| 44849.885416666664 | 7.53 |
| 44849.895833333336 | 7.56 |
| 44849.90625 | 7.67 |
| 44849.916666666664 | 7.77 |
| 44849.927083333336 | 7.8 |
| 44849.9375 | 7.9 |
| 44849.947916666664 | 8.01 |
| 44849.958333333336 | 8.16 |
| 44849.96875 | 8.19 |
| 44849.979166666664 | 8.21 |
| 44849.989583333336 | 8.18 |
| 44850.0 | 7.97 |
| 44850.010416666664 | 7.72 |
| 44850.020833333336 | 7.59 |
| 44850.03125 | 7.76 |
| 44850.041666666664 | 7.69 |
| 44850.052083333336 | 7.58 |
| 44850.0625 | 7.45 |
| 44850.072916666664 | 7.33 |
| 44850.083333333336 | 7.2 |
| 44850.09375 | 7.07 |
| 44850.104166666664 | 6.98 |
| 44850.114583333336 | 6.91 |
| 44850.125 | 6.85 |
| 44850.135416666664 | 6.78 |
| 44850.145833333336 | 6.72 |
| 44850.15625 | 6.67 |
| 44850.166666666664 | 6.6 |
| 44850.177083333336 | 6.56 |
| 44850.1875 | 6.51 |
| 44850.197916666664 | 6.47 |
| 44850.208333333336 | 6.44 |
| 44850.21875 | 6.42 |
| 44850.229166666664 | 6.36 |
| 44850.239583333336 | 6.28 |
| 44850.25 | 6.39 |
| 44850.260416666664 | 6.34 |
| 44850.270833333336 | 6.34 |
| 44850.28125 | 6.38 |
| 44850.291666666664 | 6.34 |
| 44850.302083333336 | 6.36 |
| 44850.3125 | 6.3 |
| 44850.322916666664 | 6.38 |
| 44850.333333333336 | 6.29 |
| 44850.34375 | 6.3 |
| 44850.354166666664 | 6.54 |
| 44850.364583333336 | 6.57 |
| 44850.375 | 6.58 |
| 44850.385416666664 | 6.63 |
| 44850.395833333336 | 6.68 |
| 44850.40625 | 6.8 |
| 44850.416666666664 | 6.72 |
| 44850.427083333336 | 6.8 |
| 44850.4375 | 6.74 |
| 44850.447916666664 | 6.85 |
| 44850.458333333336 | 6.79 |
| 44850.46875 | 6.72 |
| 44850.479166666664 | 6.72 |
| 44850.489583333336 | 6.64 |
| 44850.5 | 6.67 |
| 44850.510416666664 | 6.52 |
| 44850.520833333336 | 6.59 |
| 44850.53125 | 6.48 |
| 44850.541666666664 | 6.55 |
| 44850.552083333336 | 6.54 |
| 44850.5625 | 6.44 |
| 44850.572916666664 | 6.4 |
| 44850.583333333336 | 6.32 |
| 44850.59375 | 6.26 |
| 44850.604166666664 | 6.24 |
| 44850.614583333336 | 6.2 |
| 44850.625 | 6.17 |
| 44850.635416666664 | 6.18 |
| 44850.645833333336 | 6.18 |
| 44850.65625 | 6.22 |
| 44850.666666666664 | 6.28 |
| 44850.677083333336 | 6.39 |
| 44850.6875 | 6.49 |
| 44850.697916666664 | 6.56 |
| 44850.708333333336 | 6.66 |
| 44850.71875 | 6.75 |
| 44850.729166666664 | 6.82 |
| 44850.739583333336 | 6.85 |
| 44850.75 | 6.97 |
| 44850.760416666664 | 6.99 |
| 44850.770833333336 | 6.68 |
| 44850.78125 | 7.21 |
| 44850.791666666664 | 7.29 |
| 44850.802083333336 | 7.19 |
| 44850.8125 | 7.18 |
| 44850.822916666664 | 7.21 |
| 44850.833333333336 | 7.19 |
| 44850.84375 | 7.07 |
| 44850.854166666664 | 7.03 |
| 44850.864583333336 | 6.97 |
| 44850.875 | 6.95 |
| 44850.885416666664 | 6.92 |
| 44850.895833333336 | 6.88 |
| 44850.90625 | 6.87 |
| 44850.916666666664 | 6.86 |
| 44850.927083333336 | 6.89 |
| 44850.9375 | 7.18 |
| 44850.947916666664 | 7.17 |
| 44850.958333333336 | 7.24 |
| 44850.96875 | 7.25 |
| 44850.979166666664 | 7.17 |
| 44850.989583333336 | 7.35 |
| 44851.0 | 7.29 |
| 44851.010416666664 | 7.44 |
| 44851.020833333336 | 7.6 |
| 44851.03125 | 7.6 |
| 44851.041666666664 | 7.6 |
| 44851.052083333336 | 7.55 |
| 44851.0625 | 7.31 |
| 44851.072916666664 | 7.22 |
| 44851.083333333336 | 7.15 |
| 44851.09375 | 7.13 |
| 44851.104166666664 | 7.04 |
| 44851.114583333336 | 6.9 |
| 44851.125 | 6.87 |
| 44851.135416666664 | 6.83 |
| 44851.145833333336 | 6.78 |
| 44851.15625 | 6.71 |
| 44851.166666666664 | 6.66 |
| 44851.177083333336 | 6.61 |
| 44851.1875 | 6.59 |
| 44851.197916666664 | 6.63 |
| 44851.208333333336 | 6.53 |
| 44851.21875 | 6.45 |
| 44851.229166666664 | 6.52 |
| 44851.239583333336 | 6.42 |
| 44851.25 | 6.31 |
| 44851.260416666664 | 6.48 |
| 44851.270833333336 | 6.48 |
| 44851.28125 | 6.39 |
| 44851.291666666664 | 6.31 |
| 44851.302083333336 | 6.22 |
| 44851.3125 | 6.31 |
| 44851.322916666664 | 6.41 |
| 44851.333333333336 | 6.84 |
| 44851.34375 | 6.18 |
| 44851.354166666664 | 6.15 |
| 44851.364583333336 | 6.16 |
| 44851.375 | 6.14 |
| 44851.385416666664 | 6.28 |
| 44851.395833333336 | 6.36 |
| 44851.40625 | 6 |
| 44851.416666666664 | 6.06 |
| 44851.427083333336 | 6.09 |
| 44851.4375 | 6.19 |
| 44851.447916666664 | 6.4 |
| 44851.458333333336 | 6.59 |
| 44851.46875 | 6.85 |
| 44851.479166666664 | 6.85 |
| 44851.489583333336 | 6.89 |
| 44851.5 | 6.67 |
| 44851.510416666664 | 6.51 |
| 44851.520833333336 | 6.57 |
| 44851.53125 | 6.51 |
| 44851.541666666664 | 6.48 |
| 44851.552083333336 | 6.33 |
| 44851.5625 | 6.25 |
| 44851.572916666664 | 6.29 |
| 44851.583333333336 | 6.31 |
| 44851.59375 | 6.3 |
| 44851.604166666664 | 6.29 |
| 44851.614583333336 | 6.3 |
| 44851.625 | 6.35 |
| 44851.635416666664 | 6.39 |
| 44851.645833333336 | 6.41 |
| 44851.65625 | 6.44 |
| 44851.666666666664 | 6.5 |
| 44851.677083333336 | 6.52 |
| 44851.6875 | 6.59 |
| 44851.697916666664 | 6.61 |
| 44851.708333333336 | 6.65 |
| 44851.71875 | 6.69 |
| 44851.729166666664 | 6.73 |
| 44851.739583333336 | 6.72 |
| 44851.75 | 6.79 |
| 44851.760416666664 | 6.76 |
| 44851.770833333336 | 6.8 |
| 44851.78125 | 6.8 |
| 44851.791666666664 | 6.9 |
| 44851.802083333336 | 6.75 |
| 44851.8125 | 6.76 |
| 44851.822916666664 | 6.84 |
| 44851.833333333336 | 6.97 |
| 44851.84375 | 7.02 |
| 44851.854166666664 | 7.03 |
| 44851.864583333336 | 7.05 |
| 44851.875 | 7.11 |
| 44851.885416666664 | 6.98 |
| 44851.895833333336 | 7.04 |
| 44851.90625 | 6.93 |
| 44851.916666666664 | 6.94 |
| 44851.927083333336 | 6.88 |
| 44851.9375 | 6.86 |
| 44851.947916666664 | 6.74 |
| 44851.958333333336 | 6.81 |
| 44851.96875 | 6.98 |
| 44851.979166666664 | 7 |
| 44851.989583333336 | 7.12 |
| 44852.0 | 7.15 |
| 44852.010416666664 | 7.12 |
| 44852.020833333336 | 7.2 |
| 44852.03125 | 7.28 |
| 44852.041666666664 | 7.31 |
| 44852.052083333336 | 7.38 |
| 44852.0625 | 7.36 |
| 44852.072916666664 | 7.33 |
| 44852.083333333336 | 7.37 |
| 44852.09375 | 7.24 |
| 44852.104166666664 | 7.16 |
| 44852.114583333336 | 7.1 |
| 44852.125 | 6.99 |
| 44852.135416666664 | 6.9 |
| 44852.145833333336 | 6.84 |
| 44852.15625 | 6.71 |
| 44852.166666666664 | 6.65 |
| 44852.177083333336 | 6.54 |
| 44852.1875 | 6.44 |
| 44852.197916666664 | 6.4 |
| 44852.208333333336 | 6.4 |
| 44852.21875 | 6.37 |
| 44852.229166666664 | 6.36 |
| 44852.239583333336 | 6.29 |
| 44852.25 | 6.26 |
| 44852.260416666664 | 6.24 |
| 44852.270833333336 | 6.18 |
| 44852.28125 | 6.11 |
| 44852.291666666664 | 6.14 |
| 44852.302083333336 | 6.09 |
| 44852.3125 | 6.06 |
| 44852.322916666664 | 6.09 |
| 44852.333333333336 | 6.11 |
| 44852.34375 | 6.04 |
| 44852.354166666664 | 6.05 |
| 44852.364583333336 | 6.03 |
| 44852.375 | 6.03 |
| 44852.385416666664 | 6 |
| 44852.395833333336 | 5.84 |
| 44852.40625 | 5.83 |
| 44852.416666666664 | 5.98 |
| 44852.427083333336 | 5.81 |
| 44852.4375 | 5.74 |
| 44852.447916666664 | 5.79 |
| 44852.458333333336 | 5.98 |
| 44852.46875 | 5.76 |
| 44852.479166666664 | 5.99 |
| 44852.489583333336 | 6.14 |
| 44852.5 | 6.31 |
| 44852.510416666664 | 6.46 |
| 44852.520833333336 | 6.43 |
| 44852.53125 | 6.43 |
| 44852.541666666664 | 6.44 |
| 44852.552083333336 | 6.43 |
| 44852.5625 | 6.27 |
| 44852.572916666664 | 6.37 |
| 44852.583333333336 | 6.26 |
| 44852.59375 | 6.22 |
| 44852.604166666664 | 6.21 |
| 44852.614583333336 | 6.18 |
| 44852.625 | 6.12 |
| 44852.635416666664 | 6.04 |
| 44852.645833333336 | 6.02 |
| 44852.65625 | 6.17 |
| 44852.666666666664 | 6.23 |
| 44852.677083333336 | 6.26 |
| 44852.6875 | 6.3 |
| 44852.697916666664 | 6.34 |
| 44852.708333333336 | 6.4 |
| 44852.71875 | 6.48 |
| 44852.729166666664 | 6.54 |
| 44852.739583333336 | 6.6 |
| 44852.75 | 6.64 |
| 44852.760416666664 | 6.71 |
| 44852.770833333336 | 6.75 |
| 44852.78125 | 6.78 |
| 44852.791666666664 | 6.81 |
| 44852.802083333336 | 6.79 |
| 44852.8125 | 6.85 |
| 44852.822916666664 | 6.87 |
| 44852.833333333336 | 6.7 |
| 44852.84375 | 6.77 |
| 44852.854166666664 | 6.69 |
| 44852.864583333336 | 6.82 |
| 44852.875 | 6.94 |
| 44852.885416666664 | 7.04 |
| 44852.895833333336 | 7.06 |
| 44852.90625 | 7.14 |
| 44852.916666666664 | 7.09 |
| 44852.927083333336 | 7.03 |
| 44852.9375 | 7.04 |
| 44852.947916666664 | 6.99 |
| 44852.958333333336 | 6.87 |
| 44852.96875 | 6.86 |
| 44852.979166666664 | 6.83 |
| 44852.989583333336 | 6.81 |
| 44853.0 | 6.8 |
| 44853.010416666664 | 6.9 |
| 44853.020833333336 | 6.96 |
| 44853.03125 | 6.99 |
| 44853.041666666664 | 7.15 |
| 44853.052083333336 | 7.44 |
| 44853.0625 | 7.49 |
| 44853.072916666664 | 7.58 |
| 44853.083333333336 | 7.57 |
| 44853.09375 | 7.47 |
| 44853.104166666664 | 7.09 |
| 44853.114583333336 | 7.31 |
| 44853.125 | 7.3 |
| 44853.135416666664 | 7.28 |
| 44853.145833333336 | 7.24 |
| 44853.15625 | 7.17 |
| 44853.166666666664 | 7.11 |
| 44853.177083333336 | 7.02 |
| 44853.1875 | 6.96 |
| 44853.197916666664 | 6.85 |
| 44853.208333333336 | 6.82 |
| 44853.21875 | 6.81 |
| 44853.229166666664 | 6.74 |
| 44853.239583333336 | 6.67 |
| 44853.25 | 6.69 |
| 44853.260416666664 | 6.66 |
| 44853.270833333336 | 6.61 |
| 44853.28125 | 6.59 |
| 44853.291666666664 | 6.51 |
| 44853.302083333336 | 6.48 |
| 44853.3125 | 6.45 |
| 44853.322916666664 | 6.47 |
| 44853.333333333336 | 6.46 |
| 44853.34375 | 6.43 |
| 44853.354166666664 | 6.4 |
| 44853.364583333336 | 6.28 |
| 44853.375 | 6.34 |
| 44853.385416666664 | 6.33 |
| 44853.395833333336 | 6.38 |
| 44853.40625 | 6.39 |
| 44853.416666666664 | 6.42 |
| 44853.427083333336 | 6.46 |
| 44853.4375 | 6.55 |
| 44853.447916666664 | 6.33 |
| 44853.458333333336 | 6.43 |
| 44853.46875 | 6.36 |
| 44853.479166666664 | 6.47 |
| 44853.489583333336 | 6.43 |
| 44853.5 | 6.58 |
| 44853.510416666664 | 6.68 |
| 44853.520833333336 | 6.73 |
| 44853.53125 | 6.79 |
| 44853.541666666664 | 6.82 |
| 44853.552083333336 | 6.85 |
| 44853.5625 | 6.88 |
| 44853.572916666664 | 6.89 |
| 44853.583333333336 | 6.88 |
| 44853.59375 | 6.87 |
| 44853.604166666664 | 6.78 |
| 44853.614583333336 | 6.95 |
| 44853.625 | 6.9 |
| 44853.635416666664 | 6.89 |
| 44853.645833333336 | 6.88 |
| 44853.65625 | 6.88 |
| 44853.666666666664 | 6.82 |
| 44853.677083333336 | 6.84 |
| 44853.6875 | 6.86 |
| 44853.697916666664 | 6.9 |
| 44853.708333333336 | 7.07 |
| 44853.71875 | 7.23 |
| 44853.729166666664 | 7.31 |
| 44853.739583333336 | 7.41 |
| 44853.75 | 7.47 |
| 44853.760416666664 | 7.57 |
| 44853.770833333336 | 7.61 |
| 44853.78125 | 7.67 |
| 44853.791666666664 | 7.72 |
| 44853.802083333336 | 7.72 |
| 44853.8125 | 7.8 |
| 44853.822916666664 | 7.87 |
| 44853.833333333336 | 7.93 |
| 44853.84375 | 7.87 |
| 44853.854166666664 | 7.92 |
| 44853.864583333336 | 8 |
| 44853.875 | 8.01 |
| 44853.885416666664 | 8.19 |
| 44853.895833333336 | 8.16 |
| 44853.90625 | 8.1 |
| 44853.916666666664 | 8.06 |
| 44853.927083333336 | 7.99 |
| 44853.9375 | 8.1 |
| 44853.947916666664 | 8.06 |
| 44853.958333333336 | 8.06 |
| 44853.96875 | 7.91 |
| 44853.979166666664 | 7.81 |
| 44853.989583333336 | 7.68 |
| 44854.0 | 7.76 |
| 44854.010416666664 | 7.58 |
| 44854.020833333336 | 7.53 |
| 44854.03125 | 7.5 |
| 44854.041666666664 | 7.66 |
| 44854.052083333336 | 7.81 |
| 44854.0625 | 8 |
| 44854.072916666664 | 8.04 |
| 44854.083333333336 | 8.08 |
| 44854.09375 | 8.07 |
| 44854.104166666664 | 8.04 |
| 44854.114583333336 | 7.98 |
| 44854.125 | 7.85 |
| 44854.135416666664 | 7.73 |
| 44854.145833333336 | 7.8 |
| 44854.15625 | 7.85 |
| 44854.166666666664 | 7.77 |
| 44854.177083333336 | 7.72 |
| 44854.1875 | 7.74 |
| 44854.197916666664 | 7.68 |
| 44854.208333333336 | 7.62 |
| 44854.21875 | 7.59 |
| 44854.229166666664 | 7.46 |
| 44854.239583333336 | 7.46 |
| 44854.25 | 7.42 |
| 44854.260416666664 | 7.38 |
| 44854.270833333336 | 7.36 |
| 44854.28125 | 7.32 |
| 44854.291666666664 | 7.27 |
| 44854.302083333336 | 7.23 |
| 44854.3125 | 7.21 |
| 44854.322916666664 | 7.15 |
| 44854.333333333336 | 7.11 |
| 44854.34375 | 7.11 |
| 44854.354166666664 | 7.08 |
| 44854.364583333336 | 7.07 |
| 44854.375 | 7.03 |
| 44854.385416666664 | 7 |
| 44854.395833333336 | 6.98 |
| 44854.40625 | 6.9 |
| 44854.416666666664 | 6.96 |
| 44854.427083333336 | 6.93 |
| 44854.4375 | 6.87 |
| 44854.447916666664 | 6.89 |
| 44854.458333333336 | 6.88 |
| 44854.46875 | 6.74 |
| 44854.479166666664 | 6.8 |
| 44854.489583333336 | 6.88 |
| 44854.5 | 6.77 |
| 44854.510416666664 | 6.84 |
| 44854.520833333336 | 6.88 |
| 44854.53125 | 7.09 |
| 44854.541666666664 | 7.15 |
| 44854.552083333336 | 7.18 |
| 44854.5625 | 7.21 |
| 44854.572916666664 | 7.24 |
| 44854.583333333336 | 7.28 |
| 44854.59375 | 7.33 |
| 44854.604166666664 | 7.37 |
| 44854.614583333336 | 7.41 |
| 44854.625 | 7.47 |
| 44854.635416666664 | 7.46 |
| 44854.645833333336 | 7.43 |
| 44854.65625 | 7.39 |
| 44854.666666666664 | 7.4 |
| 44854.677083333336 | 7.4 |
| 44854.6875 | 7.36 |
| 44854.697916666664 | 7.35 |
| 44854.708333333336 | 7.39 |
| 44854.71875 | 7.5 |
| 44854.729166666664 | 7.7 |
| 44854.739583333336 | 7.9 |
| 44854.75 | 8.01 |
| 44854.760416666664 | 8.1 |
| 44854.770833333336 | 8.22 |
| 44854.78125 | 8.39 |
| 44854.791666666664 | 8.45 |
| 44854.802083333336 | 8.47 |
| 44854.8125 | 8.48 |
| 44854.822916666664 | 8.47 |
| 44854.833333333336 | 8.57 |
| 44854.84375 | 8.58 |
| 44854.854166666664 | 8.57 |
| 44854.864583333336 | 8.6 |
| 44854.875 | 8.63 |
| 44854.885416666664 | 8.61 |
| 44854.895833333336 | 8.62 |
| 44854.90625 | 8.58 |
| 44854.916666666664 | 8.52 |
| 44854.927083333336 | 8.54 |
| 44854.9375 | 8.36 |
| 44854.947916666664 | 8.34 |
| 44854.958333333336 | 8.34 |
| 44854.96875 | 8.45 |
| 44854.979166666664 | 8.32 |
| 44854.989583333336 | 8.24 |
| 44855.0 | 7.95 |
| 44855.010416666664 | 7.89 |
| 44855.020833333336 | 7.81 |
| 44855.03125 | 7.62 |
| 44855.041666666664 | 7.63 |
| 44855.052083333336 | 7.57 |
| 44855.0625 | 7.64 |
| 44855.072916666664 | 7.78 |
| 44855.083333333336 | 7.85 |
| 44855.09375 | 7.88 |
| 44855.104166666664 | 7.88 |
| 44855.114583333336 | 7.84 |
| 44855.125 | 7.78 |
| 44855.135416666664 | 7.77 |
| 44855.145833333336 | 7.78 |
| 44855.15625 | 7.77 |
| 44855.166666666664 | 7.67 |
| 44855.177083333336 | 7.48 |
| 44855.1875 | 7.51 |
| 44855.197916666664 | 7.59 |
| 44855.208333333336 | 7.59 |
| 44855.21875 | 7.55 |
| 44855.229166666664 | 7.53 |
| 44855.239583333336 | 7.52 |
| 44855.25 | 7.5 |
| 44855.260416666664 | 7.46 |
| 44855.270833333336 | 7.44 |
| 44855.28125 | 7.39 |
| 44855.291666666664 | 7.34 |
| 44855.302083333336 | 7.26 |
| 44855.3125 | 7.23 |
| 44855.322916666664 | 7.19 |
| 44855.333333333336 | 7.16 |
| 44855.34375 | 7.18 |
| 44855.354166666664 | 7.15 |
| 44855.364583333336 | 7.15 |
| 44855.375 | 7.12 |
| 44855.385416666664 | 7.12 |
| 44855.395833333336 | 7.13 |
| 44855.40625 | 7.09 |
| 44855.416666666664 | 7.05 |
| 44855.427083333336 | 7.02 |
| 44855.4375 | 6.67 |
| 44855.447916666664 | 6.96 |
| 44855.458333333336 | 6.91 |
| 44855.46875 | 6.91 |
| 44855.479166666664 | 6.87 |
| 44855.489583333336 | 6.85 |
| 44855.5 | 6.89 |
| 44855.510416666664 | 6.82 |
| 44855.520833333336 | 6.81 |
| 44855.53125 | 6.87 |
| 44855.541666666664 | 6.85 |
| 44855.552083333336 | 6.91 |
| 44855.5625 | 7.03 |
| 44855.572916666664 | 7.09 |
| 44855.583333333336 | 7.18 |
| 44855.59375 | 7.22 |
| 44855.604166666664 | 7.27 |
| 44855.614583333336 | 7.33 |
| 44855.625 | 7.41 |
| 44855.635416666664 | 7.48 |
| 44855.645833333336 | 7.54 |
| 44855.65625 | 7.6 |
| 44855.666666666664 | 7.62 |
| 44855.677083333336 | 7.65 |
| 44855.6875 | 7.71 |
| 44855.697916666664 | 7.67 |
| 44855.708333333336 | 7.62 |
| 44855.71875 | 7.6 |
| 44855.729166666664 | 7.56 |
| 44855.739583333336 | 7.49 |
| 44855.75 | 7.45 |
| 44855.760416666664 | 7.45 |
| 44855.770833333336 | 7.5 |
| 44855.78125 | 7.61 |
| 44855.791666666664 | 7.76 |
| 44855.802083333336 | 7.87 |
| 44855.8125 | 7.96 |
| 44855.822916666664 | 8.14 |
| 44855.833333333336 | 8.26 |
| 44855.84375 | 8.39 |
| 44855.854166666664 | 8.44 |
| 44855.864583333336 | 8.48 |
| 44855.875 | 8.52 |
| 44855.885416666664 | 8.51 |
| 44855.895833333336 | 8.48 |
| 44855.90625 | 8.39 |
| 44855.916666666664 | 8.4 |
| 44855.927083333336 | 8.31 |
| 44855.9375 | 8.34 |
| 44855.947916666664 | 8.26 |
| 44855.958333333336 | 8.19 |
| 44855.96875 | 8.13 |
| 44855.979166666664 | 7.96 |
| 44855.989583333336 | 8.03 |
| 44856.0 | 7.99 |
| 44856.010416666664 | 7.94 |
| 44856.020833333336 | 7.9 |
| 44856.03125 | 7.71 |
| 44856.041666666664 | 7.6 |
| 44856.052083333336 | 7.45 |
| 44856.0625 | 7.34 |
| 44856.072916666664 | 7.27 |
| 44856.083333333336 | 7.3 |
| 44856.09375 | 7.18 |
| 44856.104166666664 | 7.32 |
| 44856.114583333336 | 7.24 |
| 44856.125 | 7.42 |
| 44856.135416666664 | 7.42 |
| 44856.145833333336 | 7.47 |
| 44856.15625 | 7.5 |
| 44856.166666666664 | 7.52 |
| 44856.177083333336 | 7.43 |
| 44856.1875 | 7.21 |
| 44856.197916666664 | 7.12 |
| 44856.208333333336 | 7.32 |
| 44856.21875 | 7.29 |
| 44856.229166666664 | 7.32 |
| 44856.239583333336 | 7.24 |
| 44856.25 | 7.21 |
| 44856.260416666664 | 7.22 |
| 44856.270833333336 | 7.2 |
| 44856.28125 | 7.15 |
| 44856.291666666664 | 7.14 |
| 44856.302083333336 | 7.12 |
| 44856.3125 | 7.09 |
| 44856.322916666664 | 7.05 |
| 44856.333333333336 | 7.03 |
| 44856.34375 | 7.04 |
| 44856.354166666664 | 7.04 |
| 44856.364583333336 | 7.06 |
| 44856.375 | 7.06 |
| 44856.385416666664 | 7.05 |
| 44856.395833333336 | 7.05 |
| 44856.40625 | 7.04 |
| 44856.416666666664 | 7.03 |
| 44856.427083333336 | 7 |
| 44856.4375 | 6.94 |
| 44856.447916666664 | 6.89 |
| 44856.458333333336 | 6.83 |
| 44856.46875 | 6.79 |
| 44856.479166666664 | 6.75 |
| 44856.489583333336 | 6.47 |
| 44856.5 | 6.72 |
| 44856.510416666664 | 6.7 |
| 44856.520833333336 | 6.73 |
| 44856.53125 | 6.75 |
| 44856.541666666664 | 6.81 |
| 44856.552083333336 | 6.79 |
| 44856.5625 | 6.83 |
| 44856.572916666664 | 6.81 |
| 44856.583333333336 | 6.88 |
| 44856.59375 | 6.91 |
| 44856.604166666664 | 6.98 |
| 44856.614583333336 | 7.06 |
| 44856.625 | 7.16 |
| 44856.635416666664 | 7.3 |
| 44856.645833333336 | 7.43 |
| 44856.65625 | 7.57 |
| 44856.666666666664 | 7.69 |
| 44856.677083333336 | 7.79 |
| 44856.6875 | 7.88 |
| 44856.697916666664 | 7.93 |
| 44856.708333333336 | 7.97 |
| 44856.71875 | 7.99 |
| 44856.729166666664 | 7.98 |
| 44856.739583333336 | 7.87 |
| 44856.75 | 7.78 |
| 44856.760416666664 | 7.77 |
| 44856.770833333336 | 7.73 |
| 44856.78125 | 7.64 |
| 44856.791666666664 | 7.6 |
| 44856.802083333336 | 7.55 |
| 44856.8125 | 7.59 |
| 44856.822916666664 | 7.6 |
| 44856.833333333336 | 7.64 |
| 44856.84375 | 7.74 |
| 44856.854166666664 | 7.81 |
| 44856.864583333336 | 7.89 |
| 44856.875 | 7.97 |
| 44856.885416666664 | 8.02 |
| 44856.895833333336 | 8.05 |
| 44856.90625 | 8.02 |
| 44856.916666666664 | 7.98 |
| 44856.927083333336 | 7.95 |
| 44856.9375 | 7.97 |
| 44856.947916666664 | 7.94 |
| 44856.958333333336 | 7.92 |
| 44856.96875 | 7.9 |
| 44856.979166666664 | 7.87 |
| 44856.989583333336 | 7.79 |
| 44857.0 | 7.76 |
| 44857.010416666664 | 7.74 |
| 44857.020833333336 | 7.67 |
| 44857.03125 | 7.56 |
| 44857.041666666664 | 7.52 |
| 44857.052083333336 | 7.52 |
| 44857.0625 | 7.4 |
| 44857.072916666664 | 7.25 |
| 44857.083333333336 | 7.17 |
| 44857.09375 | 6.99 |
| 44857.104166666664 | 6.89 |
| 44857.114583333336 | 6.8 |
| 44857.125 | 6.62 |
| 44857.135416666664 | 6.71 |
| 44857.145833333336 | 6.65 |
| 44857.15625 | 6.83 |
| 44857.166666666664 | 6.98 |
| 44857.177083333336 | 7.04 |
| 44857.1875 | 7.13 |
| 44857.197916666664 | 7.14 |
| 44857.208333333336 | 7.14 |
| 44857.21875 | 7.08 |
| 44857.229166666664 | 7.01 |
| 44857.239583333336 | 7.18 |
| 44857.25 | 7.12 |
| 44857.260416666664 | 7.08 |
| 44857.270833333336 | 7.03 |
| 44857.28125 | 7.02 |
| 44857.291666666664 | 6.98 |
| 44857.302083333336 | 6.93 |
| 44857.3125 | 6.96 |
| 44857.322916666664 | 6.83 |
| 44857.333333333336 | 6.83 |
| 44857.34375 | 6.84 |
| 44857.354166666664 | 6.81 |
| 44857.364583333336 | 6.8 |
| 44857.375 | 6.8 |
| 44857.385416666664 | 6.79 |
| 44857.395833333336 | 6.79 |
| 44857.40625 | 6.8 |
| 44857.416666666664 | 6.84 |
| 44857.427083333336 | 6.81 |
| 44857.4375 | 6.79 |
| 44857.447916666664 | 6.76 |
| 44857.458333333336 | 6.72 |
| 44857.46875 | 6.72 |
| 44857.479166666664 | 6.68 |
| 44857.489583333336 | 6.68 |
| 44857.5 | 6.68 |
| 44857.510416666664 | 6.63 |
| 44857.520833333336 | 6.61 |
| 44857.53125 | 6.59 |
| 44857.541666666664 | 6.59 |
| 44857.552083333336 | 6.56 |
| 44857.5625 | 6.58 |
| 44857.572916666664 | 6.57 |
| 44857.583333333336 | 6.53 |
| 44857.59375 | 6.56 |
| 44857.604166666664 | 6.56 |
| 44857.614583333336 | 6.57 |
| 44857.625 | 6.54 |
| 44857.635416666664 | 6.58 |
| 44857.645833333336 | 6.58 |
| 44857.65625 | 6.58 |
| 44857.666666666664 | 6.53 |
| 44857.677083333336 | 6.56 |
| 44857.6875 | 6.63 |
| 44857.697916666664 | 6.66 |
| 44857.708333333336 | 6.72 |
| 44857.71875 | 6.8 |
| 44857.729166666664 | 6.86 |
| 44857.739583333336 | 6.88 |
| 44857.75 | 6.9 |
| 44857.760416666664 | 6.79 |
| 44857.770833333336 | 7 |
| 44857.78125 | 6.89 |
| 44857.791666666664 | 6.9 |
| 44857.802083333336 | 6.84 |
| 44857.8125 | 6.79 |
| 44857.822916666664 | 6.79 |
| 44857.833333333336 | 6.77 |
| 44857.84375 | 6.79 |
| 44857.854166666664 | 6.84 |
| 44857.864583333336 | 6.83 |
| 44857.875 | 6.8 |
| 44857.885416666664 | 6.83 |
| 44857.895833333336 | 6.85 |
| 44857.90625 | 6.84 |
| 44857.916666666664 | 6.83 |
| 44857.927083333336 | 6.83 |
| 44857.9375 | 6.82 |
| 44857.947916666664 | 6.81 |
| 44857.958333333336 | 6.82 |
| 44857.96875 | 6.8 |
| 44857.979166666664 | 6.8 |
| 44857.989583333336 | 6.81 |
| 44858.0 | 6.83 |
| 44858.010416666664 | 6.84 |
| 44858.020833333336 | 6.82 |
| 44858.03125 | 6.69 |
| 44858.041666666664 | 6.63 |
| 44858.052083333336 | 6.58 |
| 44858.0625 | 6.62 |
| 44858.072916666664 | 6.63 |
| 44858.083333333336 | 6.66 |
| 44858.09375 | 6.57 |
| 44858.104166666664 | 6.56 |
| 44858.114583333336 | 6.57 |
| 44858.125 | 6.54 |
| 44858.135416666664 | 6.44 |
| 44858.145833333336 | 6.42 |
| 44858.15625 | 6.42 |
| 44858.166666666664 | 6.25 |
| 44858.177083333336 | 6.35 |
| 44858.1875 | 6.26 |
| 44858.197916666664 | 6.22 |
| 44858.208333333336 | 6.2 |
| 44858.21875 | 6.22 |
| 44858.229166666664 | 6.22 |
| 44858.239583333336 | 6.14 |
| 44858.25 | 6.14 |
| 44858.260416666664 | 6.13 |
| 44858.270833333336 | 6.1 |
| 44858.28125 | 6.09 |
| 44858.291666666664 | 6.3 |
| 44858.302083333336 | 6.2 |
| 44858.3125 | 6.24 |
| 44858.322916666664 | 6.31 |
| 44858.333333333336 | 6.27 |
| 44858.34375 | 6.3 |
| 44858.354166666664 | 6.33 |
| 44858.364583333336 | 6.36 |
| 44858.375 | 6.4 |
| 44858.385416666664 | 6.4 |
| 44858.395833333336 | 6.39 |
| 44858.40625 | 6.39 |
| 44858.416666666664 | 6.39 |
| 44858.427083333336 | 6.43 |
| 44858.4375 | 6.41 |
| 44858.447916666664 | 6.43 |
| 44858.458333333336 | 6.42 |
| 44858.46875 | 6.45 |
| 44858.479166666664 | 6.45 |
| 44858.489583333336 | 6.46 |
| 44858.5 | 6.44 |
| 44858.510416666664 | 6.42 |
| 44858.520833333336 | 6.42 |
| 44858.53125 | 6.35 |
| 44858.541666666664 | 6.26 |
| 44858.552083333336 | 6.21 |
| 44858.5625 | 6.3 |
| 44858.572916666664 | 6.36 |
| 44858.583333333336 | 6.38 |
| 44858.59375 | 6.43 |
| 44858.604166666664 | 6.45 |
| 44858.614583333336 | 6.46 |
| 44858.625 | 6.45 |
| 44858.635416666664 | 6.43 |
| 44858.645833333336 | 6.4 |
| 44858.65625 | 6.43 |
| 44858.666666666664 | 6.44 |
| 44858.677083333336 | 6.48 |
| 44858.6875 | 6.52 |
| 44858.697916666664 | 6.57 |
| 44858.708333333336 | 6.63 |
| 44858.71875 | 6.73 |
| 44858.729166666664 | 6.82 |
| 44858.739583333336 | 6.91 |
| 44858.75 | 7.68 |
| 44858.760416666664 | 7.14 |
| 44858.770833333336 | 7.18 |
| 44858.78125 | 7.2 |
| 44858.791666666664 | 7.19 |
| 44858.802083333336 | 7.15 |
| 44858.8125 | 7.13 |
| 44858.822916666664 | 7.05 |
| 44858.833333333336 | 7 |
| 44858.84375 | 6.96 |
| 44858.854166666664 | 6.91 |
| 44858.864583333336 | 6.88 |
| 44858.875 | 6.88 |
| 44858.885416666664 | 6.94 |
| 44858.895833333336 | 6.93 |
| 44858.90625 | 6.91 |
| 44858.916666666664 | 6.9 |
| 44858.927083333336 | 6.94 |
| 44858.9375 | 6.93 |
| 44858.947916666664 | 6.91 |
| 44858.958333333336 | 6.92 |
| 44858.96875 | 6.91 |
| 44858.979166666664 | 6.87 |
| 44858.989583333336 | 6.85 |
| 44859.0 | 6.77 |
| 44859.010416666664 | 6.73 |
| 44859.020833333336 | 6.69 |
| 44859.03125 | 6.67 |
| 44859.041666666664 | 6.56 |
| 44859.052083333336 | 6.26 |
| 44859.0625 | 6.49 |
| 44859.072916666664 | 6.54 |
| 44859.083333333336 | 6.5 |
| 44859.09375 | 6.51 |
| 44859.104166666664 | 6.55 |
| 44859.114583333336 | 6.5 |
| 44859.125 | 6.51 |
| 44859.135416666664 | 6.43 |
| 44859.145833333336 | 6.37 |
| 44859.15625 | 6.2 |
| 44859.166666666664 | 6.08 |
| 44859.177083333336 | 6.04 |
| 44859.1875 | 5.88 |
| 44859.197916666664 | 5.9 |
| 44859.208333333336 | 6.08 |
| 44859.21875 | 6.27 |
| 44859.229166666664 | 6.37 |
| 44859.239583333336 | 6.38 |
| 44859.25 | 6.37 |
| 44859.260416666664 | 6.43 |
| 44859.270833333336 | 6.42 |
| 44859.28125 | 6.3 |
| 44859.291666666664 | 6.18 |
| 44859.302083333336 | 6.36 |
| 44859.3125 | 6.3 |
| 44859.322916666664 | 6.31 |
| 44859.333333333336 | 6.31 |
| 44859.34375 | 6.27 |
| 44859.354166666664 | 6.23 |
| 44859.364583333336 | 6.12 |
| 44859.375 | 6.06 |
| 44859.385416666664 | 5.99 |
| 44859.395833333336 | 5.96 |
| 44859.40625 | 5.93 |
| 44859.416666666664 | 5.91 |
| 44859.427083333336 | 5.89 |
| 44859.4375 | 5.89 |
| 44859.447916666664 | 5.87 |
| 44859.458333333336 | 5.87 |
| 44859.46875 | 5.86 |
| 44859.479166666664 | 5.84 |
| 44859.489583333336 | 5.84 |
| 44859.5 | 5.83 |
| 44859.510416666664 | 5.83 |
| 44859.520833333336 | 5.82 |
| 44859.53125 | 5.88 |
| 44859.541666666664 | 5.87 |
| 44859.552083333336 | 5.87 |
| 44859.5625 | 5.83 |
| 44859.572916666664 | 5.76 |
| 44859.583333333336 | 5.68 |
| 44859.59375 | 5.9 |
| 44859.604166666664 | 5.86 |
| 44859.614583333336 | 5.9 |
| 44859.625 | 5.94 |
| 44859.635416666664 | 5.98 |
| 44859.645833333336 | 5.98 |
| 44859.65625 | 5.98 |
| 44859.666666666664 | 5.97 |
| 44859.677083333336 | 5.97 |
| 44859.6875 | 5.99 |
| 44859.697916666664 | 5.96 |
| 44859.708333333336 | 6.02 |
| 44859.71875 | 6.05 |
| 44859.729166666664 | 6.16 |
| 44859.739583333336 | 6.18 |
| 44859.75 | 6.36 |
| 44859.760416666664 | 6.46 |
| 44859.770833333336 | 6.52 |
| 44859.78125 | 6.61 |
| 44859.791666666664 | 6.69 |
| 44859.802083333336 | 6.74 |
| 44859.8125 | 6.67 |
| 44859.822916666664 | 6.52 |
| 44859.833333333336 | 6.62 |
| 44859.84375 | 6.58 |
| 44859.854166666664 | 6.56 |
| 44859.864583333336 | 6.49 |
| 44859.875 | 6.44 |
| 44859.885416666664 | 6.38 |
| 44859.895833333336 | 6.34 |
| 44859.90625 | 6.28 |
| 44859.916666666664 | 6.29 |
| 44859.927083333336 | 6.23 |
| 44859.9375 | 6.19 |
| 44859.947916666664 | 6.19 |
| 44859.958333333336 | 6.19 |
| 44859.96875 | 6.16 |
| 44859.979166666664 | 6.13 |
| 44859.989583333336 | 6.13 |
| 44860.0 | 6.15 |
| 44860.010416666664 | 6.11 |
| 44860.020833333336 | 6.11 |
| 44860.03125 | 6.11 |
| 44860.041666666664 | 6.08 |
| 44860.052083333336 | 6.07 |
| 44860.0625 | 6 |
| 44860.072916666664 | 5.97 |
| 44860.083333333336 | 5.79 |
| 44860.09375 | 5.86 |
| 44860.104166666664 | 5.89 |
| 44860.114583333336 | 5.82 |
| 44860.125 | 5.92 |
| 44860.135416666664 | 5.87 |
| 44860.145833333336 | 5.84 |
| 44860.15625 | 5.8 |
| 44860.166666666664 | 5.75 |
| 44860.177083333336 | 5.65 |
| 44860.1875 | 5.55 |
| 44860.197916666664 | 5.42 |
| 44860.208333333336 | 5.36 |
| 44860.21875 | 5.43 |
| 44860.229166666664 | 5.36 |
| 44860.239583333336 | 5.54 |
| 44860.25 | 5.67 |
| 44860.260416666664 | 5.74 |
| 44860.270833333336 | 5.78 |
| 44860.28125 | 5.79 |
| 44860.291666666664 | 5.81 |
| 44860.302083333336 | 5.79 |
| 44860.3125 | 5.66 |
| 44860.322916666664 | 5.74 |
| 44860.333333333336 | 5.7 |
| 44860.34375 | 5.7 |
| 44860.354166666664 | 5.72 |
| 44860.364583333336 | 5.68 |
| 44860.375 | 5.62 |
| 44860.385416666664 | 5.56 |
| 44860.395833333336 | 5.49 |
| 44860.40625 | 5.45 |
| 44860.416666666664 | 5.42 |
| 44860.427083333336 | 5.39 |
| 44860.4375 | 5.38 |
| 44860.447916666664 | 5.34 |
| 44860.458333333336 | 5.32 |
| 44860.46875 | 5.33 |
| 44860.479166666664 | 5.35 |
| 44860.489583333336 | 5.37 |
| 44860.5 | 5.39 |
| 44860.510416666664 | 5.41 |
| 44860.520833333336 | 5.45 |
| 44860.53125 | 5.48 |
| 44860.541666666664 | 5.47 |
| 44860.552083333336 | 5.47 |
| 44860.5625 | 5.45 |
| 44860.572916666664 | 5.45 |
| 44860.583333333336 | 5.47 |
| 44860.59375 | 5.48 |
| 44860.604166666664 | 5.42 |
| 44860.614583333336 | 5.38 |
| 44860.625 | 5.49 |
| 44860.635416666664 | 5.53 |
| 44860.645833333336 | 5.63 |
| 44860.65625 | 5.61 |
| 44860.666666666664 | 5.66 |
| 44860.677083333336 | 5.6 |
| 44860.6875 | 5.73 |
| 44860.697916666664 | 5.69 |
| 44860.708333333336 | 5.67 |
| 44860.71875 | 5.69 |
| 44860.729166666664 | 5.69 |
| 44860.739583333336 | 5.73 |
| 44860.75 | 5.8 |
| 44860.760416666664 | 5.84 |
| 44860.770833333336 | 5.91 |
| 44860.78125 | 6.01 |
| 44860.791666666664 | 6.14 |
| 44860.802083333336 | 6.22 |
| 44860.8125 | 6.36 |
| 44860.822916666664 | 6.46 |
| 44860.833333333336 | 6.46 |
| 44860.84375 | 6.43 |
| 44860.854166666664 | 6.41 |
| 44860.864583333336 | 6.33 |
| 44860.875 | 6.19 |
| 44860.885416666664 | 6.18 |
| 44860.895833333336 | 6.11 |
| 44860.90625 | 6.06 |
| 44860.916666666664 | 6 |
| 44860.927083333336 | 5.97 |
| 44860.9375 | 5.95 |
| 44860.947916666664 | 5.94 |
| 44860.958333333336 | 5.93 |
| 44860.96875 | 5.92 |
| 44860.979166666664 | 5.9 |
| 44860.989583333336 | 5.87 |
| 44861.0 | 5.85 |
| 44861.010416666664 | 5.8 |
| 44861.020833333336 | 5.78 |
| 44861.03125 | 5.77 |
| 44861.041666666664 | 5.99 |
| 44861.052083333336 | 5.77 |
| 44861.0625 | 5.75 |
| 44861.072916666664 | 5.73 |
| 44861.083333333336 | 5.71 |
| 44861.09375 | 5.69 |
| 44861.104166666664 | 5.66 |
| 44861.114583333336 | 5.51 |
| 44861.125 | 5.57 |
| 44861.135416666664 | 5.56 |
| 44861.145833333336 | 5.5 |
| 44861.15625 | 5.53 |
| 44861.166666666664 | 5.44 |
| 44861.177083333336 | 5.43 |
| 44861.1875 | 5.35 |
| 44861.197916666664 | 5.16 |
| 44861.208333333336 | 5.11 |
| 44861.21875 | 5.04 |
| 44861.229166666664 | 5.04 |
| 44861.239583333336 | 5 |
| 44861.25 | 5.07 |
| 44861.260416666664 | 5.19 |
| 44861.270833333336 | 5.24 |
| 44861.28125 | 5.38 |
| 44861.291666666664 | 5.49 |
| 44861.302083333336 | 5.6 |
| 44861.3125 | 5.79 |
| 44861.322916666664 | 5.45 |
| 44861.333333333336 | 5.46 |
| 44861.34375 | 5.38 |
| 44861.354166666664 | 5.42 |
| 44861.364583333336 | 5.37 |
| 44861.375 | 5.34 |
| 44861.385416666664 | 5.36 |
| 44861.395833333336 | 5.35 |
| 44861.40625 | 5.3 |
| 44861.416666666664 | 5.27 |
| 44861.427083333336 | 5.25 |
| 44861.4375 | 5.22 |
| 44861.447916666664 | 5.21 |
| 44861.458333333336 | 5.2 |
| 44861.46875 | 5.21 |
| 44861.479166666664 | 5.21 |
| 44861.489583333336 | 5.22 |
| 44861.5 | 5.22 |
| 44861.510416666664 | 5.25 |
| 44861.520833333336 | 5.27 |
| 44861.53125 | 5.3 |
| 44861.541666666664 | 5.35 |
| 44861.552083333336 | 5.4 |
| 44861.5625 | 5.46 |
| 44861.572916666664 | 5.51 |
| 44861.583333333336 | 5.57 |
| 44861.59375 | 5.64 |
| 44861.604166666664 | 5.7 |
| 44861.614583333336 | 5.77 |
| 44861.625 | 5.83 |
| 44861.635416666664 | 5.84 |
| 44861.645833333336 | 5.83 |
| 44861.65625 | 5.98 |
| 44861.666666666664 | 6.07 |
| 44861.677083333336 | 6.13 |
| 44861.6875 | 6.21 |
| 44861.697916666664 | 6.27 |
| 44861.708333333336 | 6.29 |
| 44861.71875 | 6.31 |
| 44861.729166666664 | 6.38 |
| 44861.739583333336 | 6.46 |
| 44861.75 | 6.47 |
| 44861.760416666664 | 6.5 |
| 44861.770833333336 | 6.47 |
| 44861.78125 | 6.56 |
| 44861.791666666664 | 6.58 |
| 44861.802083333336 | 6.61 |
| 44861.8125 | 6.66 |
| 44861.822916666664 | 6.7 |
| 44861.833333333336 | 6.75 |
| 44861.84375 | 6.78 |
| 44861.854166666664 | 6.82 |
| 44861.864583333336 | 6.81 |
| 44861.875 | 6.93 |
| 44861.885416666664 | 6.83 |
| 44861.895833333336 | 6.9 |
| 44861.90625 | 6.73 |
| 44861.916666666664 | 6.67 |
| 44861.927083333336 | 6.62 |
| 44861.9375 | 6.53 |
| 44861.947916666664 | 6.45 |
| 44861.958333333336 | 6.31 |
| 44861.96875 | 6.26 |
| 44861.979166666664 | 6.21 |
| 44861.989583333336 | 6.16 |
| 44862.0 | 6.12 |
| 44862.010416666664 | 6.07 |
| 44862.020833333336 | 6.01 |
| 44862.03125 | 5.98 |
| 44862.041666666664 | 5.96 |
| 44862.052083333336 | 5.92 |
| 44862.0625 | 6.24 |
| 44862.072916666664 | 5.9 |
| 44862.083333333336 | 5.87 |
| 44862.09375 | 5.87 |
| 44862.104166666664 | 6.09 |
| 44862.114583333336 | 5.81 |
| 44862.125 | 5.78 |
| 44862.135416666664 | 5.71 |
| 44862.145833333336 | 5.71 |
| 44862.15625 | 5.7 |
| 44862.166666666664 | 5.66 |
| 44862.177083333336 | 5.66 |
| 44862.1875 | 5.62 |
| 44862.197916666664 | 5.58 |
| 44862.208333333336 | 5.54 |
| 44862.21875 | 5.5 |
| 44862.229166666664 | 5.46 |
| 44862.239583333336 | 5.42 |
| 44862.25 | 5.37 |
| 44862.260416666664 | 5.42 |
| 44862.270833333336 | 5.38 |
| 44862.28125 | 5.41 |
| 44862.291666666664 | 5.52 |
| 44862.302083333336 | 5.57 |
| 44862.3125 | 5.6 |
| 44862.322916666664 | 5.68 |
| 44862.333333333336 | 5.73 |
| 44862.34375 | 5.75 |
| 44862.354166666664 | 5.74 |
| 44862.364583333336 | 5.67 |
| 44862.375 | 5.72 |
| 44862.385416666664 | 5.66 |
| 44862.395833333336 | 5.63 |
| 44862.40625 | 5.65 |
| 44862.416666666664 | 5.64 |
| 44862.427083333336 | 5.58 |
| 44862.4375 | 5.55 |
| 44862.447916666664 | 5.5 |
| 44862.458333333336 | 5.47 |
| 44862.46875 | 5.44 |
| 44862.479166666664 | 5.42 |
| 44862.489583333336 | 5.41 |
| 44862.5 | 5.41 |
| 44862.510416666664 | 5.41 |
| 44862.520833333336 | 5.42 |
| 44862.53125 | 5.46 |
| 44862.541666666664 | 5.49 |
| 44862.552083333336 | 5.55 |
| 44862.5625 | 5.65 |
| 44862.572916666664 | 5.75 |
| 44862.583333333336 | 5.85 |
| 44862.59375 | 5.96 |
| 44862.604166666664 | 6.05 |
| 44862.614583333336 | 6.1 |
| 44862.625 | 6.09 |
| 44862.635416666664 | 6.08 |
| 44862.645833333336 | 6.08 |
| 44862.65625 | 6.03 |
| 44862.666666666664 | 6.13 |
| 44862.677083333336 | 6.2 |
| 44862.6875 | 6.19 |
| 44862.697916666664 | 6.27 |
| 44862.708333333336 | 6.26 |
| 44862.71875 | 6.31 |
| 44862.729166666664 | 6.28 |
| 44862.739583333336 | 6.3 |
| 44862.75 | 6.34 |
| 44862.760416666664 | 6.28 |
| 44862.770833333336 | 6.31 |
| 44862.78125 | 6.34 |
| 44862.791666666664 | 6.36 |
| 44862.802083333336 | 6.38 |
| 44862.8125 | 6.36 |
| 44862.822916666664 | 6.34 |
| 44862.833333333336 | 6.27 |
| 44862.84375 | 6.27 |
| 44862.854166666664 | 6.24 |
| 44862.864583333336 | 6.16 |
| 44862.875 | 6.11 |
| 44862.885416666664 | 6.17 |
| 44862.895833333336 | 6.21 |
| 44862.90625 | 6.21 |
| 44862.916666666664 | 6.21 |
| 44862.927083333336 | 6.31 |
| 44862.9375 | 6.23 |
| 44862.947916666664 | 6.29 |
| 44862.958333333336 | 6.22 |
| 44862.96875 | 6.21 |
| 44862.979166666664 | 6.2 |
| 44862.989583333336 | 6.19 |
| 44863.0 | 6.15 |
| 44863.010416666664 | 6.1 |
| 44863.020833333336 | 6.06 |
| 44863.03125 | 6.01 |
| 44863.041666666664 | 5.97 |
| 44863.052083333336 | 5.93 |
| 44863.0625 | 5.9 |
| 44863.072916666664 | 5.87 |
| 44863.083333333336 | 5.85 |
| 44863.09375 | 5.81 |
| 44863.104166666664 | 5.79 |
| 44863.114583333336 | 5.77 |
| 44863.125 | 5.76 |
| 44863.135416666664 | 5.75 |
| 44863.145833333336 | 5.73 |
| 44863.15625 | 5.72 |
| 44863.166666666664 | 5.67 |
| 44863.177083333336 | 5.66 |
| 44863.1875 | 5.65 |
| 44863.197916666664 | 5.62 |
| 44863.208333333336 | 5.59 |
| 44863.21875 | 5.6 |
| 44863.229166666664 | 5.58 |
| 44863.239583333336 | 5.56 |
| 44863.25 | 5.52 |
| 44863.260416666664 | 5.48 |
| 44863.270833333336 | 5.43 |
| 44863.28125 | 5.39 |
| 44863.291666666664 | 5.36 |
| 44863.302083333336 | 5.28 |
| 44863.3125 | 5.24 |
| 44863.322916666664 | 5.22 |
| 44863.333333333336 | 5.24 |
| 44863.34375 | 5.21 |
| 44863.354166666664 | 5.24 |
| 44863.364583333336 | 5.27 |
| 44863.375 | 5.29 |
| 44863.385416666664 | 5.3 |
| 44863.395833333336 | 5.38 |
| 44863.40625 | 5.4 |
| 44863.416666666664 | 5.4 |
| 44863.427083333336 | 5.66 |
| 44863.4375 | 5.35 |
| 44863.447916666664 | 5.31 |
| 44863.458333333336 | 5.35 |
| 44863.46875 | 5.35 |
| 44863.479166666664 | 5.36 |
| 44863.489583333336 | 5.36 |
| 44863.5 | 5.37 |
| 44863.510416666664 | 5.38 |
| 44863.520833333336 | 5.41 |
| 44863.53125 | 5.42 |
| 44863.541666666664 | 5.45 |
| 44863.552083333336 | 5.5 |
| 44863.5625 | 5.57 |
| 44863.572916666664 | 5.64 |
| 44863.583333333336 | 5.71 |
| 44863.59375 | 5.81 |
| 44863.604166666664 | 5.91 |
| 44863.614583333336 | 6 |
| 44863.625 | 6.08 |
| 44863.635416666664 | 6.16 |
| 44863.645833333336 | 6.24 |
| 44863.65625 | 6.3 |
| 44863.666666666664 | 6.37 |
| 44863.677083333336 | 6.41 |
| 44863.6875 | 6.28 |
| 44863.697916666664 | 6.27 |
| 44863.708333333336 | 6.38 |
| 44863.71875 | 6.4 |
| 44863.729166666664 | 6.38 |
| 44863.739583333336 | 6.38 |
| 44863.75 | 6.55 |
| 44863.760416666664 | 6.53 |
| 44863.770833333336 | 6.32 |
| 44863.78125 | 6.44 |
| 44863.791666666664 | 6.38 |
| 44863.802083333336 | 6.45 |
| 44863.8125 | 6.42 |
| 44863.822916666664 | 6.35 |
| 44863.833333333336 | 6.28 |
| 44863.84375 | 6.24 |
| 44863.854166666664 | 6.16 |
| 44863.864583333336 | 6.14 |
| 44863.875 | 6.1 |
| 44863.885416666664 | 6.07 |
| 44863.895833333336 | 6.04 |
| 44863.90625 | 6.09 |
| 44863.916666666664 | 6.13 |
| 44863.927083333336 | 6.13 |
| 44863.9375 | 6.12 |
| 44863.947916666664 | 6.14 |
| 44863.958333333336 | 6.25 |
| 44863.96875 | 6.2 |
| 44863.979166666664 | 6.23 |
| 44863.989583333336 | 6.13 |
| 44864.0 | 6.13 |
| 44864.010416666664 | 6.15 |
| 44864.020833333336 | 6.13 |
| 44864.03125 | 6.07 |
| 44864.041666666664 | 6.04 |
| 44864.052083333336 | 5.97 |
| 44864.0625 | 5.87 |
| 44864.072916666664 | 5.81 |
| 44864.083333333336 | 5.78 |
| 44864.09375 | 5.76 |
| 44864.104166666664 | 5.73 |
| 44864.114583333336 | 5.7 |
| 44864.125 | 5.67 |
| 44864.135416666664 | 5.63 |
| 44864.145833333336 | 5.59 |
| 44864.15625 | 5.56 |
| 44864.166666666664 | 5.55 |
| 44864.177083333336 | 5.53 |
| 44864.1875 | 5.5 |
| 44864.197916666664 | 5.48 |
| 44864.208333333336 | 5.41 |
| 44864.21875 | 5.43 |
| 44864.229166666664 | 5.43 |
| 44864.239583333336 | 5.41 |
| 44864.25 | 5.38 |
| 44864.260416666664 | 5.38 |
| 44864.270833333336 | 5.35 |
| 44864.28125 | 5.32 |
| 44864.291666666664 | 5.32 |
| 44864.302083333336 | 5.28 |
| 44864.3125 | 5.24 |
| 44864.322916666664 | 5.2 |
| 44864.333333333336 | 5.17 |
| 44864.34375 | 5.15 |
| 44864.354166666664 | 5.14 |
| 44864.364583333336 | 5.13 |
| 44864.375 | 5.16 |
| 44864.385416666664 | 5.22 |
| 44864.395833333336 | 5.19 |
| 44864.40625 | 5.28 |
| 44864.416666666664 | 5.25 |
| 44864.427083333336 | 5.23 |
| 44864.4375 | 5.23 |
| 44864.447916666664 | 5.24 |
| 44864.458333333336 | 5.21 |
| 44864.46875 | 5.25 |
| 44864.479166666664 | 5.2 |
| 44864.489583333336 | 5.2 |
| 44864.5 | 5.29 |
| 44864.510416666664 | 5.26 |
| 44864.520833333336 | 5.22 |
| 44864.53125 | 5.23 |
| 44864.541666666664 | 5.23 |
| 44864.552083333336 | 5.22 |
| 44864.5625 | 5.23 |
| 44864.572916666664 | 5.25 |
| 44864.583333333336 | 5.27 |
| 44864.59375 | 5.29 |
| 44864.604166666664 | 5.32 |
| 44864.614583333336 | 5.37 |
| 44864.625 | 5.38 |
| 44864.635416666664 | 5.43 |
| 44864.645833333336 | 5.47 |
| 44864.65625 | 5.66 |
| 44864.666666666664 | 5.84 |
| 44864.677083333336 | 5.94 |
| 44864.6875 | 6.03 |
| 44864.697916666664 | 6.1 |
| 44864.708333333336 | 6.17 |
| 44864.71875 | 6.18 |
| 44864.729166666664 | 6.03 |
| 44864.739583333336 | 6.01 |
| 44864.75 | 5.84 |
| 44864.760416666664 | 5.84 |
| 44864.770833333336 | 5.83 |
| 44864.78125 | 5.78 |
| 44864.791666666664 | 5.82 |
| 44864.802083333336 | 5.82 |
| 44864.8125 | 5.84 |
| 44864.822916666664 | 5.79 |
| 44864.833333333336 | 5.77 |
| 44864.84375 | 5.77 |
| 44864.854166666664 | 5.74 |
| 44864.864583333336 | 5.72 |
| 44864.875 | 5.71 |
| 44864.885416666664 | 5.62 |
| 44864.895833333336 | 5.61 |
| 44864.90625 | 5.55 |
| 44864.916666666664 | 5.57 |
| 44864.927083333336 | 5.58 |
| 44864.9375 | 5.58 |
| 44864.947916666664 | 5.62 |
| 44864.958333333336 | 5.66 |
| 44864.96875 | 5.74 |
| 44864.979166666664 | 5.76 |
| 44864.989583333336 | 5.77 |
| 44865.0 | 5.76 |
| 44865.010416666664 | 5.77 |
| 44865.020833333336 | 5.76 |
| 44865.03125 | 5.66 |
| 44865.041666666664 | 5.68 |
| 44865.052083333336 | 5.69 |
| 44865.0625 | 5.67 |
| 44865.072916666664 | 5.61 |
| 44865.083333333336 | 5.58 |
| 44865.09375 | 5.53 |
| 44865.104166666664 | 5.45 |
| 44865.114583333336 | 5.36 |
| 44865.125 | 5.33 |
| 44865.135416666664 | 5.29 |
| 44865.145833333336 | 5.27 |
| 44865.15625 | 5.25 |
| 44865.166666666664 | 5.23 |
| 44865.177083333336 | 5.19 |
| 44865.1875 | 5.19 |
| 44865.197916666664 | 5.15 |
| 44865.208333333336 | 5.13 |
| 44865.21875 | 5.1 |
| 44865.229166666664 | 5.08 |
| 44865.239583333336 | 5 |
| 44865.25 | 4.99 |
| 44865.260416666664 | 5.03 |
| 44865.270833333336 | 5.02 |
| 44865.28125 | 5 |
| 44865.291666666664 | 5 |
| 44865.302083333336 | 4.96 |
| 44865.3125 | 4.95 |
| 44865.322916666664 | 4.96 |
| 44865.333333333336 | 4.99 |
| 44865.34375 | 4.98 |
| 44865.354166666664 | 4.95 |
| 44865.364583333336 | 4.92 |
| 44865.375 | 4.94 |
| 44865.385416666664 | 4.89 |
| 44865.395833333336 | 4.99 |
| 44865.40625 | 4.96 |
| 44865.416666666664 | 4.97 |
| 44865.427083333336 | 4.97 |
| 44865.4375 | 5 |
| 44865.447916666664 | 5.01 |
| 44865.458333333336 | 5.01 |
| 44865.46875 | 5.01 |
| 44865.479166666664 | 4.96 |
| 44865.489583333336 | 4.93 |
| 44865.5 | 4.91 |
| 44865.510416666664 | 4.95 |
| 44865.520833333336 | 4.92 |
| 44865.53125 | 4.98 |
| 44865.541666666664 | 5.01 |
| 44865.552083333336 | 5.01 |
| 44865.5625 | 5.12 |
| 44865.572916666664 | 5.06 |
| 44865.583333333336 | 5.11 |
| 44865.59375 | 5.15 |
| 44865.604166666664 | 5.39 |
| 44865.614583333336 | 5.31 |
| 44865.625 | 5.38 |
| 44865.635416666664 | 5.41 |
| 44865.645833333336 | 5.46 |
| 44865.65625 | 5.54 |
| 44865.666666666664 | 5.43 |
| 44865.677083333336 | 5.57 |
| 44865.6875 | 5.61 |
| 44865.697916666664 | 5.6 |
| 44865.708333333336 | 5.67 |
| 44865.71875 | 5.72 |
| 44865.729166666664 | 5.71 |
| 44865.739583333336 | 5.85 |
| 44865.75 | 5.88 |
| 44865.760416666664 | 5.85 |
| 44865.770833333336 | 5.78 |
| 44865.78125 | 5.59 |
| 44865.791666666664 | 5.56 |
| 44865.802083333336 | 5.69 |
| 44865.8125 | 5.67 |
| 44865.822916666664 | 5.62 |
| 44865.833333333336 | 5.57 |
| 44865.84375 | 5.5 |
| 44865.854166666664 | 5.5 |
| 44865.864583333336 | 5.46 |
| 44865.875 | 5.41 |
| 44865.885416666664 | 5.33 |
| 44865.895833333336 | 5.3 |
| 44865.90625 | 5.22 |
| 44865.916666666664 | 5.18 |
| 44865.927083333336 | 5.16 |
| 44865.9375 | 5.15 |
| 44865.947916666664 | 5.14 |
| 44865.958333333336 | 5.12 |
| 44865.96875 | 5.12 |
| 44865.979166666664 | 5.11 |
| 44865.989583333336 | 5.17 |
| 44866.0 | 5.2 |
| 44866.010416666664 | 5.21 |
| 44866.020833333336 | 5.25 |
| 44866.03125 | 5.24 |
| 44866.041666666664 | 5.22 |
| 44866.052083333336 | 5.22 |
| 44866.0625 | 5.19 |
| 44866.072916666664 | 5.16 |
| 44866.083333333336 | 5.19 |
| 44866.09375 | 5.16 |
| 44866.104166666664 | 5.12 |
| 44866.114583333336 | 5.06 |
| 44866.125 | 5.02 |
| 44866.135416666664 | 4.96 |
| 44866.145833333336 | 4.95 |